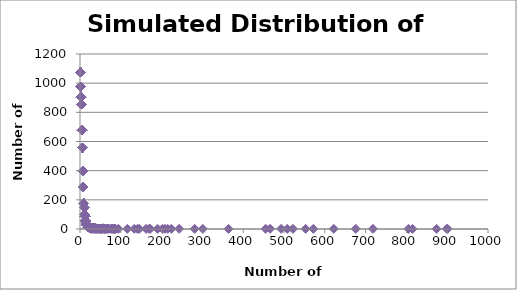
| Category | Simulated Number of Athletes |
|---|---|
| 901.0 | 1 |
| 899.0 | 1 |
| 874.0 | 1 |
| 815.0 | 1 |
| 805.0 | 1 |
| 718.0 | 1 |
| 676.0 | 1 |
| 622.0 | 1 |
| 572.0 | 1 |
| 553.0 | 1 |
| 522.0 | 1 |
| 508.0 | 1 |
| 493.0 | 1 |
| 466.0 | 1 |
| 455.0 | 1 |
| 364.0 | 1 |
| 301.0 | 1 |
| 281.0 | 1 |
| 243.0 | 1 |
| 224.0 | 1 |
| 215.0 | 1 |
| 208.0 | 1 |
| 202.0 | 1 |
| 190.0 | 1 |
| 172.0 | 1 |
| 169.0 | 1 |
| 162.0 | 1 |
| 145.0 | 1 |
| 141.0 | 1 |
| 133.0 | 1 |
| 116.0 | 1 |
| 94.0 | 1 |
| 87.0 | 1 |
| 86.0 | 1 |
| 85.0 | 1 |
| 84.0 | 1 |
| 82.0 | 1 |
| 80.0 | 1 |
| 78.0 | 2 |
| 78.0 | 2 |
| 74.0 | 1 |
| 69.0 | 3 |
| 69.0 | 3 |
| 69.0 | 3 |
| 68.0 | 1 |
| 64.0 | 1 |
| 63.0 | 1 |
| 61.0 | 1 |
| 60.0 | 1 |
| 58.0 | 3 |
| 58.0 | 3 |
| 58.0 | 3 |
| 57.0 | 4 |
| 57.0 | 4 |
| 57.0 | 4 |
| 57.0 | 4 |
| 56.0 | 2 |
| 56.0 | 2 |
| 54.0 | 2 |
| 54.0 | 2 |
| 52.0 | 2 |
| 52.0 | 2 |
| 51.0 | 1 |
| 50.0 | 2 |
| 50.0 | 2 |
| 49.0 | 1 |
| 48.0 | 3 |
| 48.0 | 3 |
| 48.0 | 3 |
| 47.0 | 1 |
| 44.0 | 3 |
| 44.0 | 3 |
| 44.0 | 3 |
| 42.0 | 2 |
| 42.0 | 2 |
| 41.0 | 3 |
| 41.0 | 3 |
| 41.0 | 3 |
| 40.0 | 3 |
| 40.0 | 3 |
| 40.0 | 3 |
| 39.0 | 3 |
| 39.0 | 3 |
| 39.0 | 3 |
| 38.0 | 5 |
| 38.0 | 5 |
| 38.0 | 5 |
| 38.0 | 5 |
| 38.0 | 5 |
| 37.0 | 2 |
| 37.0 | 2 |
| 36.0 | 5 |
| 36.0 | 5 |
| 36.0 | 5 |
| 36.0 | 5 |
| 36.0 | 5 |
| 35.0 | 1 |
| 34.0 | 6 |
| 34.0 | 6 |
| 34.0 | 6 |
| 34.0 | 6 |
| 34.0 | 6 |
| 34.0 | 6 |
| 33.0 | 3 |
| 33.0 | 3 |
| 33.0 | 3 |
| 32.0 | 4 |
| 32.0 | 4 |
| 32.0 | 4 |
| 32.0 | 4 |
| 31.0 | 6 |
| 31.0 | 6 |
| 31.0 | 6 |
| 31.0 | 6 |
| 31.0 | 6 |
| 31.0 | 6 |
| 30.0 | 2 |
| 30.0 | 2 |
| 29.0 | 4 |
| 29.0 | 4 |
| 29.0 | 4 |
| 29.0 | 4 |
| 28.0 | 7 |
| 28.0 | 7 |
| 28.0 | 7 |
| 28.0 | 7 |
| 28.0 | 7 |
| 28.0 | 7 |
| 28.0 | 7 |
| 27.0 | 2 |
| 27.0 | 2 |
| 26.0 | 9 |
| 26.0 | 9 |
| 26.0 | 9 |
| 26.0 | 9 |
| 26.0 | 9 |
| 26.0 | 9 |
| 26.0 | 9 |
| 26.0 | 9 |
| 26.0 | 9 |
| 25.0 | 7 |
| 25.0 | 7 |
| 25.0 | 7 |
| 25.0 | 7 |
| 25.0 | 7 |
| 25.0 | 7 |
| 25.0 | 7 |
| 24.0 | 5 |
| 24.0 | 5 |
| 24.0 | 5 |
| 24.0 | 5 |
| 24.0 | 5 |
| 23.0 | 13 |
| 23.0 | 13 |
| 23.0 | 13 |
| 23.0 | 13 |
| 23.0 | 13 |
| 23.0 | 13 |
| 23.0 | 13 |
| 23.0 | 13 |
| 23.0 | 13 |
| 23.0 | 13 |
| 23.0 | 13 |
| 23.0 | 13 |
| 23.0 | 13 |
| 22.0 | 10 |
| 22.0 | 10 |
| 22.0 | 10 |
| 22.0 | 10 |
| 22.0 | 10 |
| 22.0 | 10 |
| 22.0 | 10 |
| 22.0 | 10 |
| 22.0 | 10 |
| 22.0 | 10 |
| 21.0 | 11 |
| 21.0 | 11 |
| 21.0 | 11 |
| 21.0 | 11 |
| 21.0 | 11 |
| 21.0 | 11 |
| 21.0 | 11 |
| 21.0 | 11 |
| 21.0 | 11 |
| 21.0 | 11 |
| 21.0 | 11 |
| 20.0 | 13 |
| 20.0 | 13 |
| 20.0 | 13 |
| 20.0 | 13 |
| 20.0 | 13 |
| 20.0 | 13 |
| 20.0 | 13 |
| 20.0 | 13 |
| 20.0 | 13 |
| 20.0 | 13 |
| 20.0 | 13 |
| 20.0 | 13 |
| 20.0 | 13 |
| 19.0 | 12 |
| 19.0 | 12 |
| 19.0 | 12 |
| 19.0 | 12 |
| 19.0 | 12 |
| 19.0 | 12 |
| 19.0 | 12 |
| 19.0 | 12 |
| 19.0 | 12 |
| 19.0 | 12 |
| 19.0 | 12 |
| 19.0 | 12 |
| 18.0 | 23 |
| 18.0 | 23 |
| 18.0 | 23 |
| 18.0 | 23 |
| 18.0 | 23 |
| 18.0 | 23 |
| 18.0 | 23 |
| 18.0 | 23 |
| 18.0 | 23 |
| 18.0 | 23 |
| 18.0 | 23 |
| 18.0 | 23 |
| 18.0 | 23 |
| 18.0 | 23 |
| 18.0 | 23 |
| 18.0 | 23 |
| 18.0 | 23 |
| 18.0 | 23 |
| 18.0 | 23 |
| 18.0 | 23 |
| 18.0 | 23 |
| 18.0 | 23 |
| 18.0 | 23 |
| 17.0 | 25 |
| 17.0 | 25 |
| 17.0 | 25 |
| 17.0 | 25 |
| 17.0 | 25 |
| 17.0 | 25 |
| 17.0 | 25 |
| 17.0 | 25 |
| 17.0 | 25 |
| 17.0 | 25 |
| 17.0 | 25 |
| 17.0 | 25 |
| 17.0 | 25 |
| 17.0 | 25 |
| 17.0 | 25 |
| 17.0 | 25 |
| 17.0 | 25 |
| 17.0 | 25 |
| 17.0 | 25 |
| 17.0 | 25 |
| 17.0 | 25 |
| 17.0 | 25 |
| 17.0 | 25 |
| 17.0 | 25 |
| 17.0 | 25 |
| 16.0 | 30 |
| 16.0 | 30 |
| 16.0 | 30 |
| 16.0 | 30 |
| 16.0 | 30 |
| 16.0 | 30 |
| 16.0 | 30 |
| 16.0 | 30 |
| 16.0 | 30 |
| 16.0 | 30 |
| 16.0 | 30 |
| 16.0 | 30 |
| 16.0 | 30 |
| 16.0 | 30 |
| 16.0 | 30 |
| 16.0 | 30 |
| 16.0 | 30 |
| 16.0 | 30 |
| 16.0 | 30 |
| 16.0 | 30 |
| 16.0 | 30 |
| 16.0 | 30 |
| 16.0 | 30 |
| 16.0 | 30 |
| 16.0 | 30 |
| 16.0 | 30 |
| 16.0 | 30 |
| 16.0 | 30 |
| 16.0 | 30 |
| 16.0 | 30 |
| 15.0 | 37 |
| 15.0 | 37 |
| 15.0 | 37 |
| 15.0 | 37 |
| 15.0 | 37 |
| 15.0 | 37 |
| 15.0 | 37 |
| 15.0 | 37 |
| 15.0 | 37 |
| 15.0 | 37 |
| 15.0 | 37 |
| 15.0 | 37 |
| 15.0 | 37 |
| 15.0 | 37 |
| 15.0 | 37 |
| 15.0 | 37 |
| 15.0 | 37 |
| 15.0 | 37 |
| 15.0 | 37 |
| 15.0 | 37 |
| 15.0 | 37 |
| 15.0 | 37 |
| 15.0 | 37 |
| 15.0 | 37 |
| 15.0 | 37 |
| 15.0 | 37 |
| 15.0 | 37 |
| 15.0 | 37 |
| 15.0 | 37 |
| 15.0 | 37 |
| 15.0 | 37 |
| 15.0 | 37 |
| 15.0 | 37 |
| 15.0 | 37 |
| 15.0 | 37 |
| 15.0 | 37 |
| 15.0 | 37 |
| 14.0 | 53 |
| 14.0 | 53 |
| 14.0 | 53 |
| 14.0 | 53 |
| 14.0 | 53 |
| 14.0 | 53 |
| 14.0 | 53 |
| 14.0 | 53 |
| 14.0 | 53 |
| 14.0 | 53 |
| 14.0 | 53 |
| 14.0 | 53 |
| 14.0 | 53 |
| 14.0 | 53 |
| 14.0 | 53 |
| 14.0 | 53 |
| 14.0 | 53 |
| 14.0 | 53 |
| 14.0 | 53 |
| 14.0 | 53 |
| 14.0 | 53 |
| 14.0 | 53 |
| 14.0 | 53 |
| 14.0 | 53 |
| 14.0 | 53 |
| 14.0 | 53 |
| 14.0 | 53 |
| 14.0 | 53 |
| 14.0 | 53 |
| 14.0 | 53 |
| 14.0 | 53 |
| 14.0 | 53 |
| 14.0 | 53 |
| 14.0 | 53 |
| 14.0 | 53 |
| 14.0 | 53 |
| 14.0 | 53 |
| 14.0 | 53 |
| 14.0 | 53 |
| 14.0 | 53 |
| 14.0 | 53 |
| 14.0 | 53 |
| 14.0 | 53 |
| 14.0 | 53 |
| 14.0 | 53 |
| 14.0 | 53 |
| 14.0 | 53 |
| 14.0 | 53 |
| 14.0 | 53 |
| 14.0 | 53 |
| 14.0 | 53 |
| 14.0 | 53 |
| 14.0 | 53 |
| 13.0 | 58 |
| 13.0 | 58 |
| 13.0 | 58 |
| 13.0 | 58 |
| 13.0 | 58 |
| 13.0 | 58 |
| 13.0 | 58 |
| 13.0 | 58 |
| 13.0 | 58 |
| 13.0 | 58 |
| 13.0 | 58 |
| 13.0 | 58 |
| 13.0 | 58 |
| 13.0 | 58 |
| 13.0 | 58 |
| 13.0 | 58 |
| 13.0 | 58 |
| 13.0 | 58 |
| 13.0 | 58 |
| 13.0 | 58 |
| 13.0 | 58 |
| 13.0 | 58 |
| 13.0 | 58 |
| 13.0 | 58 |
| 13.0 | 58 |
| 13.0 | 58 |
| 13.0 | 58 |
| 13.0 | 58 |
| 13.0 | 58 |
| 13.0 | 58 |
| 13.0 | 58 |
| 13.0 | 58 |
| 13.0 | 58 |
| 13.0 | 58 |
| 13.0 | 58 |
| 13.0 | 58 |
| 13.0 | 58 |
| 13.0 | 58 |
| 13.0 | 58 |
| 13.0 | 58 |
| 13.0 | 58 |
| 13.0 | 58 |
| 13.0 | 58 |
| 13.0 | 58 |
| 13.0 | 58 |
| 13.0 | 58 |
| 13.0 | 58 |
| 13.0 | 58 |
| 13.0 | 58 |
| 13.0 | 58 |
| 13.0 | 58 |
| 13.0 | 58 |
| 13.0 | 58 |
| 13.0 | 58 |
| 13.0 | 58 |
| 13.0 | 58 |
| 13.0 | 58 |
| 13.0 | 58 |
| 12.0 | 88 |
| 12.0 | 88 |
| 12.0 | 88 |
| 12.0 | 88 |
| 12.0 | 88 |
| 12.0 | 88 |
| 12.0 | 88 |
| 12.0 | 88 |
| 12.0 | 88 |
| 12.0 | 88 |
| 12.0 | 88 |
| 12.0 | 88 |
| 12.0 | 88 |
| 12.0 | 88 |
| 12.0 | 88 |
| 12.0 | 88 |
| 12.0 | 88 |
| 12.0 | 88 |
| 12.0 | 88 |
| 12.0 | 88 |
| 12.0 | 88 |
| 12.0 | 88 |
| 12.0 | 88 |
| 12.0 | 88 |
| 12.0 | 88 |
| 12.0 | 88 |
| 12.0 | 88 |
| 12.0 | 88 |
| 12.0 | 88 |
| 12.0 | 88 |
| 12.0 | 88 |
| 12.0 | 88 |
| 12.0 | 88 |
| 12.0 | 88 |
| 12.0 | 88 |
| 12.0 | 88 |
| 12.0 | 88 |
| 12.0 | 88 |
| 12.0 | 88 |
| 12.0 | 88 |
| 12.0 | 88 |
| 12.0 | 88 |
| 12.0 | 88 |
| 12.0 | 88 |
| 12.0 | 88 |
| 12.0 | 88 |
| 12.0 | 88 |
| 12.0 | 88 |
| 12.0 | 88 |
| 12.0 | 88 |
| 12.0 | 88 |
| 12.0 | 88 |
| 12.0 | 88 |
| 12.0 | 88 |
| 12.0 | 88 |
| 12.0 | 88 |
| 12.0 | 88 |
| 12.0 | 88 |
| 12.0 | 88 |
| 12.0 | 88 |
| 12.0 | 88 |
| 12.0 | 88 |
| 12.0 | 88 |
| 12.0 | 88 |
| 12.0 | 88 |
| 12.0 | 88 |
| 12.0 | 88 |
| 12.0 | 88 |
| 12.0 | 88 |
| 12.0 | 88 |
| 12.0 | 88 |
| 12.0 | 88 |
| 12.0 | 88 |
| 12.0 | 88 |
| 12.0 | 88 |
| 12.0 | 88 |
| 12.0 | 88 |
| 12.0 | 88 |
| 12.0 | 88 |
| 12.0 | 88 |
| 12.0 | 88 |
| 12.0 | 88 |
| 12.0 | 88 |
| 12.0 | 88 |
| 12.0 | 88 |
| 12.0 | 88 |
| 12.0 | 88 |
| 12.0 | 88 |
| 11.0 | 101 |
| 11.0 | 101 |
| 11.0 | 101 |
| 11.0 | 101 |
| 11.0 | 101 |
| 11.0 | 101 |
| 11.0 | 101 |
| 11.0 | 101 |
| 11.0 | 101 |
| 11.0 | 101 |
| 11.0 | 101 |
| 11.0 | 101 |
| 11.0 | 101 |
| 11.0 | 101 |
| 11.0 | 101 |
| 11.0 | 101 |
| 11.0 | 101 |
| 11.0 | 101 |
| 11.0 | 101 |
| 11.0 | 101 |
| 11.0 | 101 |
| 11.0 | 101 |
| 11.0 | 101 |
| 11.0 | 101 |
| 11.0 | 101 |
| 11.0 | 101 |
| 11.0 | 101 |
| 11.0 | 101 |
| 11.0 | 101 |
| 11.0 | 101 |
| 11.0 | 101 |
| 11.0 | 101 |
| 11.0 | 101 |
| 11.0 | 101 |
| 11.0 | 101 |
| 11.0 | 101 |
| 11.0 | 101 |
| 11.0 | 101 |
| 11.0 | 101 |
| 11.0 | 101 |
| 11.0 | 101 |
| 11.0 | 101 |
| 11.0 | 101 |
| 11.0 | 101 |
| 11.0 | 101 |
| 11.0 | 101 |
| 11.0 | 101 |
| 11.0 | 101 |
| 11.0 | 101 |
| 11.0 | 101 |
| 11.0 | 101 |
| 11.0 | 101 |
| 11.0 | 101 |
| 11.0 | 101 |
| 11.0 | 101 |
| 11.0 | 101 |
| 11.0 | 101 |
| 11.0 | 101 |
| 11.0 | 101 |
| 11.0 | 101 |
| 11.0 | 101 |
| 11.0 | 101 |
| 11.0 | 101 |
| 11.0 | 101 |
| 11.0 | 101 |
| 11.0 | 101 |
| 11.0 | 101 |
| 11.0 | 101 |
| 11.0 | 101 |
| 11.0 | 101 |
| 11.0 | 101 |
| 11.0 | 101 |
| 11.0 | 101 |
| 11.0 | 101 |
| 11.0 | 101 |
| 11.0 | 101 |
| 11.0 | 101 |
| 11.0 | 101 |
| 11.0 | 101 |
| 11.0 | 101 |
| 11.0 | 101 |
| 11.0 | 101 |
| 11.0 | 101 |
| 11.0 | 101 |
| 11.0 | 101 |
| 11.0 | 101 |
| 11.0 | 101 |
| 11.0 | 101 |
| 11.0 | 101 |
| 11.0 | 101 |
| 11.0 | 101 |
| 11.0 | 101 |
| 11.0 | 101 |
| 11.0 | 101 |
| 11.0 | 101 |
| 11.0 | 101 |
| 11.0 | 101 |
| 11.0 | 101 |
| 11.0 | 101 |
| 11.0 | 101 |
| 11.0 | 101 |
| 10.0 | 147 |
| 10.0 | 147 |
| 10.0 | 147 |
| 10.0 | 147 |
| 10.0 | 147 |
| 10.0 | 147 |
| 10.0 | 147 |
| 10.0 | 147 |
| 10.0 | 147 |
| 10.0 | 147 |
| 10.0 | 147 |
| 10.0 | 147 |
| 10.0 | 147 |
| 10.0 | 147 |
| 10.0 | 147 |
| 10.0 | 147 |
| 10.0 | 147 |
| 10.0 | 147 |
| 10.0 | 147 |
| 10.0 | 147 |
| 10.0 | 147 |
| 10.0 | 147 |
| 10.0 | 147 |
| 10.0 | 147 |
| 10.0 | 147 |
| 10.0 | 147 |
| 10.0 | 147 |
| 10.0 | 147 |
| 10.0 | 147 |
| 10.0 | 147 |
| 10.0 | 147 |
| 10.0 | 147 |
| 10.0 | 147 |
| 10.0 | 147 |
| 10.0 | 147 |
| 10.0 | 147 |
| 10.0 | 147 |
| 10.0 | 147 |
| 10.0 | 147 |
| 10.0 | 147 |
| 10.0 | 147 |
| 10.0 | 147 |
| 10.0 | 147 |
| 10.0 | 147 |
| 10.0 | 147 |
| 10.0 | 147 |
| 10.0 | 147 |
| 10.0 | 147 |
| 10.0 | 147 |
| 10.0 | 147 |
| 10.0 | 147 |
| 10.0 | 147 |
| 10.0 | 147 |
| 10.0 | 147 |
| 10.0 | 147 |
| 10.0 | 147 |
| 10.0 | 147 |
| 10.0 | 147 |
| 10.0 | 147 |
| 10.0 | 147 |
| 10.0 | 147 |
| 10.0 | 147 |
| 10.0 | 147 |
| 10.0 | 147 |
| 10.0 | 147 |
| 10.0 | 147 |
| 10.0 | 147 |
| 10.0 | 147 |
| 10.0 | 147 |
| 10.0 | 147 |
| 10.0 | 147 |
| 10.0 | 147 |
| 10.0 | 147 |
| 10.0 | 147 |
| 10.0 | 147 |
| 10.0 | 147 |
| 10.0 | 147 |
| 10.0 | 147 |
| 10.0 | 147 |
| 10.0 | 147 |
| 10.0 | 147 |
| 10.0 | 147 |
| 10.0 | 147 |
| 10.0 | 147 |
| 10.0 | 147 |
| 10.0 | 147 |
| 10.0 | 147 |
| 10.0 | 147 |
| 10.0 | 147 |
| 10.0 | 147 |
| 10.0 | 147 |
| 10.0 | 147 |
| 10.0 | 147 |
| 10.0 | 147 |
| 10.0 | 147 |
| 10.0 | 147 |
| 10.0 | 147 |
| 10.0 | 147 |
| 10.0 | 147 |
| 10.0 | 147 |
| 10.0 | 147 |
| 10.0 | 147 |
| 10.0 | 147 |
| 10.0 | 147 |
| 10.0 | 147 |
| 10.0 | 147 |
| 10.0 | 147 |
| 10.0 | 147 |
| 10.0 | 147 |
| 10.0 | 147 |
| 10.0 | 147 |
| 10.0 | 147 |
| 10.0 | 147 |
| 10.0 | 147 |
| 10.0 | 147 |
| 10.0 | 147 |
| 10.0 | 147 |
| 10.0 | 147 |
| 10.0 | 147 |
| 10.0 | 147 |
| 10.0 | 147 |
| 10.0 | 147 |
| 10.0 | 147 |
| 10.0 | 147 |
| 10.0 | 147 |
| 10.0 | 147 |
| 10.0 | 147 |
| 10.0 | 147 |
| 10.0 | 147 |
| 10.0 | 147 |
| 10.0 | 147 |
| 10.0 | 147 |
| 10.0 | 147 |
| 10.0 | 147 |
| 10.0 | 147 |
| 10.0 | 147 |
| 10.0 | 147 |
| 10.0 | 147 |
| 10.0 | 147 |
| 10.0 | 147 |
| 10.0 | 147 |
| 10.0 | 147 |
| 10.0 | 147 |
| 10.0 | 147 |
| 10.0 | 147 |
| 10.0 | 147 |
| 10.0 | 147 |
| 9.0 | 177 |
| 9.0 | 177 |
| 9.0 | 177 |
| 9.0 | 177 |
| 9.0 | 177 |
| 9.0 | 177 |
| 9.0 | 177 |
| 9.0 | 177 |
| 9.0 | 177 |
| 9.0 | 177 |
| 9.0 | 177 |
| 9.0 | 177 |
| 9.0 | 177 |
| 9.0 | 177 |
| 9.0 | 177 |
| 9.0 | 177 |
| 9.0 | 177 |
| 9.0 | 177 |
| 9.0 | 177 |
| 9.0 | 177 |
| 9.0 | 177 |
| 9.0 | 177 |
| 9.0 | 177 |
| 9.0 | 177 |
| 9.0 | 177 |
| 9.0 | 177 |
| 9.0 | 177 |
| 9.0 | 177 |
| 9.0 | 177 |
| 9.0 | 177 |
| 9.0 | 177 |
| 9.0 | 177 |
| 9.0 | 177 |
| 9.0 | 177 |
| 9.0 | 177 |
| 9.0 | 177 |
| 9.0 | 177 |
| 9.0 | 177 |
| 9.0 | 177 |
| 9.0 | 177 |
| 9.0 | 177 |
| 9.0 | 177 |
| 9.0 | 177 |
| 9.0 | 177 |
| 9.0 | 177 |
| 9.0 | 177 |
| 9.0 | 177 |
| 9.0 | 177 |
| 9.0 | 177 |
| 9.0 | 177 |
| 9.0 | 177 |
| 9.0 | 177 |
| 9.0 | 177 |
| 9.0 | 177 |
| 9.0 | 177 |
| 9.0 | 177 |
| 9.0 | 177 |
| 9.0 | 177 |
| 9.0 | 177 |
| 9.0 | 177 |
| 9.0 | 177 |
| 9.0 | 177 |
| 9.0 | 177 |
| 9.0 | 177 |
| 9.0 | 177 |
| 9.0 | 177 |
| 9.0 | 177 |
| 9.0 | 177 |
| 9.0 | 177 |
| 9.0 | 177 |
| 9.0 | 177 |
| 9.0 | 177 |
| 9.0 | 177 |
| 9.0 | 177 |
| 9.0 | 177 |
| 9.0 | 177 |
| 9.0 | 177 |
| 9.0 | 177 |
| 9.0 | 177 |
| 9.0 | 177 |
| 9.0 | 177 |
| 9.0 | 177 |
| 9.0 | 177 |
| 9.0 | 177 |
| 9.0 | 177 |
| 9.0 | 177 |
| 9.0 | 177 |
| 9.0 | 177 |
| 9.0 | 177 |
| 9.0 | 177 |
| 9.0 | 177 |
| 9.0 | 177 |
| 9.0 | 177 |
| 9.0 | 177 |
| 9.0 | 177 |
| 9.0 | 177 |
| 9.0 | 177 |
| 9.0 | 177 |
| 9.0 | 177 |
| 9.0 | 177 |
| 9.0 | 177 |
| 9.0 | 177 |
| 9.0 | 177 |
| 9.0 | 177 |
| 9.0 | 177 |
| 9.0 | 177 |
| 9.0 | 177 |
| 9.0 | 177 |
| 9.0 | 177 |
| 9.0 | 177 |
| 9.0 | 177 |
| 9.0 | 177 |
| 9.0 | 177 |
| 9.0 | 177 |
| 9.0 | 177 |
| 9.0 | 177 |
| 9.0 | 177 |
| 9.0 | 177 |
| 9.0 | 177 |
| 9.0 | 177 |
| 9.0 | 177 |
| 9.0 | 177 |
| 9.0 | 177 |
| 9.0 | 177 |
| 9.0 | 177 |
| 9.0 | 177 |
| 9.0 | 177 |
| 9.0 | 177 |
| 9.0 | 177 |
| 9.0 | 177 |
| 9.0 | 177 |
| 9.0 | 177 |
| 9.0 | 177 |
| 9.0 | 177 |
| 9.0 | 177 |
| 9.0 | 177 |
| 9.0 | 177 |
| 9.0 | 177 |
| 9.0 | 177 |
| 9.0 | 177 |
| 9.0 | 177 |
| 9.0 | 177 |
| 9.0 | 177 |
| 9.0 | 177 |
| 9.0 | 177 |
| 9.0 | 177 |
| 9.0 | 177 |
| 9.0 | 177 |
| 9.0 | 177 |
| 9.0 | 177 |
| 9.0 | 177 |
| 9.0 | 177 |
| 9.0 | 177 |
| 9.0 | 177 |
| 9.0 | 177 |
| 9.0 | 177 |
| 9.0 | 177 |
| 9.0 | 177 |
| 9.0 | 177 |
| 9.0 | 177 |
| 9.0 | 177 |
| 9.0 | 177 |
| 9.0 | 177 |
| 9.0 | 177 |
| 9.0 | 177 |
| 9.0 | 177 |
| 9.0 | 177 |
| 9.0 | 177 |
| 9.0 | 177 |
| 9.0 | 177 |
| 9.0 | 177 |
| 9.0 | 177 |
| 9.0 | 177 |
| 9.0 | 177 |
| 9.0 | 177 |
| 9.0 | 177 |
| 9.0 | 177 |
| 8.0 | 288 |
| 8.0 | 288 |
| 8.0 | 288 |
| 8.0 | 288 |
| 8.0 | 288 |
| 8.0 | 288 |
| 8.0 | 288 |
| 8.0 | 288 |
| 8.0 | 288 |
| 8.0 | 288 |
| 8.0 | 288 |
| 8.0 | 288 |
| 8.0 | 288 |
| 8.0 | 288 |
| 8.0 | 288 |
| 8.0 | 288 |
| 8.0 | 288 |
| 8.0 | 288 |
| 8.0 | 288 |
| 8.0 | 288 |
| 8.0 | 288 |
| 8.0 | 288 |
| 8.0 | 288 |
| 8.0 | 288 |
| 8.0 | 288 |
| 8.0 | 288 |
| 8.0 | 288 |
| 8.0 | 288 |
| 8.0 | 288 |
| 8.0 | 288 |
| 8.0 | 288 |
| 8.0 | 288 |
| 8.0 | 288 |
| 8.0 | 288 |
| 8.0 | 288 |
| 8.0 | 288 |
| 8.0 | 288 |
| 8.0 | 288 |
| 8.0 | 288 |
| 8.0 | 288 |
| 8.0 | 288 |
| 8.0 | 288 |
| 8.0 | 288 |
| 8.0 | 288 |
| 8.0 | 288 |
| 8.0 | 288 |
| 8.0 | 288 |
| 8.0 | 288 |
| 8.0 | 288 |
| 8.0 | 288 |
| 8.0 | 288 |
| 8.0 | 288 |
| 8.0 | 288 |
| 8.0 | 288 |
| 8.0 | 288 |
| 8.0 | 288 |
| 8.0 | 288 |
| 8.0 | 288 |
| 8.0 | 288 |
| 8.0 | 288 |
| 8.0 | 288 |
| 8.0 | 288 |
| 8.0 | 288 |
| 8.0 | 288 |
| 8.0 | 288 |
| 8.0 | 288 |
| 8.0 | 288 |
| 8.0 | 288 |
| 8.0 | 288 |
| 8.0 | 288 |
| 8.0 | 288 |
| 8.0 | 288 |
| 8.0 | 288 |
| 8.0 | 288 |
| 8.0 | 288 |
| 8.0 | 288 |
| 8.0 | 288 |
| 8.0 | 288 |
| 8.0 | 288 |
| 8.0 | 288 |
| 8.0 | 288 |
| 8.0 | 288 |
| 8.0 | 288 |
| 8.0 | 288 |
| 8.0 | 288 |
| 8.0 | 288 |
| 8.0 | 288 |
| 8.0 | 288 |
| 8.0 | 288 |
| 8.0 | 288 |
| 8.0 | 288 |
| 8.0 | 288 |
| 8.0 | 288 |
| 8.0 | 288 |
| 8.0 | 288 |
| 8.0 | 288 |
| 8.0 | 288 |
| 8.0 | 288 |
| 8.0 | 288 |
| 8.0 | 288 |
| 8.0 | 288 |
| 8.0 | 288 |
| 8.0 | 288 |
| 8.0 | 288 |
| 8.0 | 288 |
| 8.0 | 288 |
| 8.0 | 288 |
| 8.0 | 288 |
| 8.0 | 288 |
| 8.0 | 288 |
| 8.0 | 288 |
| 8.0 | 288 |
| 8.0 | 288 |
| 8.0 | 288 |
| 8.0 | 288 |
| 8.0 | 288 |
| 8.0 | 288 |
| 8.0 | 288 |
| 8.0 | 288 |
| 8.0 | 288 |
| 8.0 | 288 |
| 8.0 | 288 |
| 8.0 | 288 |
| 8.0 | 288 |
| 8.0 | 288 |
| 8.0 | 288 |
| 8.0 | 288 |
| 8.0 | 288 |
| 8.0 | 288 |
| 8.0 | 288 |
| 8.0 | 288 |
| 8.0 | 288 |
| 8.0 | 288 |
| 8.0 | 288 |
| 8.0 | 288 |
| 8.0 | 288 |
| 8.0 | 288 |
| 8.0 | 288 |
| 8.0 | 288 |
| 8.0 | 288 |
| 8.0 | 288 |
| 8.0 | 288 |
| 8.0 | 288 |
| 8.0 | 288 |
| 8.0 | 288 |
| 8.0 | 288 |
| 8.0 | 288 |
| 8.0 | 288 |
| 8.0 | 288 |
| 8.0 | 288 |
| 8.0 | 288 |
| 8.0 | 288 |
| 8.0 | 288 |
| 8.0 | 288 |
| 8.0 | 288 |
| 8.0 | 288 |
| 8.0 | 288 |
| 8.0 | 288 |
| 8.0 | 288 |
| 8.0 | 288 |
| 8.0 | 288 |
| 8.0 | 288 |
| 8.0 | 288 |
| 8.0 | 288 |
| 8.0 | 288 |
| 8.0 | 288 |
| 8.0 | 288 |
| 8.0 | 288 |
| 8.0 | 288 |
| 8.0 | 288 |
| 8.0 | 288 |
| 8.0 | 288 |
| 8.0 | 288 |
| 8.0 | 288 |
| 8.0 | 288 |
| 8.0 | 288 |
| 8.0 | 288 |
| 8.0 | 288 |
| 8.0 | 288 |
| 8.0 | 288 |
| 8.0 | 288 |
| 8.0 | 288 |
| 8.0 | 288 |
| 8.0 | 288 |
| 8.0 | 288 |
| 8.0 | 288 |
| 8.0 | 288 |
| 8.0 | 288 |
| 8.0 | 288 |
| 8.0 | 288 |
| 8.0 | 288 |
| 8.0 | 288 |
| 8.0 | 288 |
| 8.0 | 288 |
| 8.0 | 288 |
| 8.0 | 288 |
| 8.0 | 288 |
| 8.0 | 288 |
| 8.0 | 288 |
| 8.0 | 288 |
| 8.0 | 288 |
| 8.0 | 288 |
| 8.0 | 288 |
| 8.0 | 288 |
| 8.0 | 288 |
| 8.0 | 288 |
| 8.0 | 288 |
| 8.0 | 288 |
| 8.0 | 288 |
| 8.0 | 288 |
| 8.0 | 288 |
| 8.0 | 288 |
| 8.0 | 288 |
| 8.0 | 288 |
| 8.0 | 288 |
| 8.0 | 288 |
| 8.0 | 288 |
| 8.0 | 288 |
| 8.0 | 288 |
| 8.0 | 288 |
| 8.0 | 288 |
| 8.0 | 288 |
| 8.0 | 288 |
| 8.0 | 288 |
| 8.0 | 288 |
| 8.0 | 288 |
| 8.0 | 288 |
| 8.0 | 288 |
| 8.0 | 288 |
| 8.0 | 288 |
| 8.0 | 288 |
| 8.0 | 288 |
| 8.0 | 288 |
| 8.0 | 288 |
| 8.0 | 288 |
| 8.0 | 288 |
| 8.0 | 288 |
| 8.0 | 288 |
| 8.0 | 288 |
| 8.0 | 288 |
| 8.0 | 288 |
| 8.0 | 288 |
| 8.0 | 288 |
| 8.0 | 288 |
| 8.0 | 288 |
| 8.0 | 288 |
| 8.0 | 288 |
| 8.0 | 288 |
| 8.0 | 288 |
| 8.0 | 288 |
| 8.0 | 288 |
| 8.0 | 288 |
| 8.0 | 288 |
| 8.0 | 288 |
| 8.0 | 288 |
| 8.0 | 288 |
| 8.0 | 288 |
| 8.0 | 288 |
| 8.0 | 288 |
| 8.0 | 288 |
| 8.0 | 288 |
| 8.0 | 288 |
| 8.0 | 288 |
| 8.0 | 288 |
| 8.0 | 288 |
| 8.0 | 288 |
| 8.0 | 288 |
| 8.0 | 288 |
| 8.0 | 288 |
| 8.0 | 288 |
| 8.0 | 288 |
| 8.0 | 288 |
| 8.0 | 288 |
| 8.0 | 288 |
| 8.0 | 288 |
| 8.0 | 288 |
| 8.0 | 288 |
| 8.0 | 288 |
| 8.0 | 288 |
| 8.0 | 288 |
| 8.0 | 288 |
| 8.0 | 288 |
| 8.0 | 288 |
| 8.0 | 288 |
| 8.0 | 288 |
| 8.0 | 288 |
| 8.0 | 288 |
| 8.0 | 288 |
| 7.0 | 398 |
| 7.0 | 398 |
| 7.0 | 398 |
| 7.0 | 398 |
| 7.0 | 398 |
| 7.0 | 398 |
| 7.0 | 398 |
| 7.0 | 398 |
| 7.0 | 398 |
| 7.0 | 398 |
| 7.0 | 398 |
| 7.0 | 398 |
| 7.0 | 398 |
| 7.0 | 398 |
| 7.0 | 398 |
| 7.0 | 398 |
| 7.0 | 398 |
| 7.0 | 398 |
| 7.0 | 398 |
| 7.0 | 398 |
| 7.0 | 398 |
| 7.0 | 398 |
| 7.0 | 398 |
| 7.0 | 398 |
| 7.0 | 398 |
| 7.0 | 398 |
| 7.0 | 398 |
| 7.0 | 398 |
| 7.0 | 398 |
| 7.0 | 398 |
| 7.0 | 398 |
| 7.0 | 398 |
| 7.0 | 398 |
| 7.0 | 398 |
| 7.0 | 398 |
| 7.0 | 398 |
| 7.0 | 398 |
| 7.0 | 398 |
| 7.0 | 398 |
| 7.0 | 398 |
| 7.0 | 398 |
| 7.0 | 398 |
| 7.0 | 398 |
| 7.0 | 398 |
| 7.0 | 398 |
| 7.0 | 398 |
| 7.0 | 398 |
| 7.0 | 398 |
| 7.0 | 398 |
| 7.0 | 398 |
| 7.0 | 398 |
| 7.0 | 398 |
| 7.0 | 398 |
| 7.0 | 398 |
| 7.0 | 398 |
| 7.0 | 398 |
| 7.0 | 398 |
| 7.0 | 398 |
| 7.0 | 398 |
| 7.0 | 398 |
| 7.0 | 398 |
| 7.0 | 398 |
| 7.0 | 398 |
| 7.0 | 398 |
| 7.0 | 398 |
| 7.0 | 398 |
| 7.0 | 398 |
| 7.0 | 398 |
| 7.0 | 398 |
| 7.0 | 398 |
| 7.0 | 398 |
| 7.0 | 398 |
| 7.0 | 398 |
| 7.0 | 398 |
| 7.0 | 398 |
| 7.0 | 398 |
| 7.0 | 398 |
| 7.0 | 398 |
| 7.0 | 398 |
| 7.0 | 398 |
| 7.0 | 398 |
| 7.0 | 398 |
| 7.0 | 398 |
| 7.0 | 398 |
| 7.0 | 398 |
| 7.0 | 398 |
| 7.0 | 398 |
| 7.0 | 398 |
| 7.0 | 398 |
| 7.0 | 398 |
| 7.0 | 398 |
| 7.0 | 398 |
| 7.0 | 398 |
| 7.0 | 398 |
| 7.0 | 398 |
| 7.0 | 398 |
| 7.0 | 398 |
| 7.0 | 398 |
| 7.0 | 398 |
| 7.0 | 398 |
| 7.0 | 398 |
| 7.0 | 398 |
| 7.0 | 398 |
| 7.0 | 398 |
| 7.0 | 398 |
| 7.0 | 398 |
| 7.0 | 398 |
| 7.0 | 398 |
| 7.0 | 398 |
| 7.0 | 398 |
| 7.0 | 398 |
| 7.0 | 398 |
| 7.0 | 398 |
| 7.0 | 398 |
| 7.0 | 398 |
| 7.0 | 398 |
| 7.0 | 398 |
| 7.0 | 398 |
| 7.0 | 398 |
| 7.0 | 398 |
| 7.0 | 398 |
| 7.0 | 398 |
| 7.0 | 398 |
| 7.0 | 398 |
| 7.0 | 398 |
| 7.0 | 398 |
| 7.0 | 398 |
| 7.0 | 398 |
| 7.0 | 398 |
| 7.0 | 398 |
| 7.0 | 398 |
| 7.0 | 398 |
| 7.0 | 398 |
| 7.0 | 398 |
| 7.0 | 398 |
| 7.0 | 398 |
| 7.0 | 398 |
| 7.0 | 398 |
| 7.0 | 398 |
| 7.0 | 398 |
| 7.0 | 398 |
| 7.0 | 398 |
| 7.0 | 398 |
| 7.0 | 398 |
| 7.0 | 398 |
| 7.0 | 398 |
| 7.0 | 398 |
| 7.0 | 398 |
| 7.0 | 398 |
| 7.0 | 398 |
| 7.0 | 398 |
| 7.0 | 398 |
| 7.0 | 398 |
| 7.0 | 398 |
| 7.0 | 398 |
| 7.0 | 398 |
| 7.0 | 398 |
| 7.0 | 398 |
| 7.0 | 398 |
| 7.0 | 398 |
| 7.0 | 398 |
| 7.0 | 398 |
| 7.0 | 398 |
| 7.0 | 398 |
| 7.0 | 398 |
| 7.0 | 398 |
| 7.0 | 398 |
| 7.0 | 398 |
| 7.0 | 398 |
| 7.0 | 398 |
| 7.0 | 398 |
| 7.0 | 398 |
| 7.0 | 398 |
| 7.0 | 398 |
| 7.0 | 398 |
| 7.0 | 398 |
| 7.0 | 398 |
| 7.0 | 398 |
| 7.0 | 398 |
| 7.0 | 398 |
| 7.0 | 398 |
| 7.0 | 398 |
| 7.0 | 398 |
| 7.0 | 398 |
| 7.0 | 398 |
| 7.0 | 398 |
| 7.0 | 398 |
| 7.0 | 398 |
| 7.0 | 398 |
| 7.0 | 398 |
| 7.0 | 398 |
| 7.0 | 398 |
| 7.0 | 398 |
| 7.0 | 398 |
| 7.0 | 398 |
| 7.0 | 398 |
| 7.0 | 398 |
| 7.0 | 398 |
| 7.0 | 398 |
| 7.0 | 398 |
| 7.0 | 398 |
| 7.0 | 398 |
| 7.0 | 398 |
| 7.0 | 398 |
| 7.0 | 398 |
| 7.0 | 398 |
| 7.0 | 398 |
| 7.0 | 398 |
| 7.0 | 398 |
| 7.0 | 398 |
| 7.0 | 398 |
| 7.0 | 398 |
| 7.0 | 398 |
| 7.0 | 398 |
| 7.0 | 398 |
| 7.0 | 398 |
| 7.0 | 398 |
| 7.0 | 398 |
| 7.0 | 398 |
| 7.0 | 398 |
| 7.0 | 398 |
| 7.0 | 398 |
| 7.0 | 398 |
| 7.0 | 398 |
| 7.0 | 398 |
| 7.0 | 398 |
| 7.0 | 398 |
| 7.0 | 398 |
| 7.0 | 398 |
| 7.0 | 398 |
| 7.0 | 398 |
| 7.0 | 398 |
| 7.0 | 398 |
| 7.0 | 398 |
| 7.0 | 398 |
| 7.0 | 398 |
| 7.0 | 398 |
| 7.0 | 398 |
| 7.0 | 398 |
| 7.0 | 398 |
| 7.0 | 398 |
| 7.0 | 398 |
| 7.0 | 398 |
| 7.0 | 398 |
| 7.0 | 398 |
| 7.0 | 398 |
| 7.0 | 398 |
| 7.0 | 398 |
| 7.0 | 398 |
| 7.0 | 398 |
| 7.0 | 398 |
| 7.0 | 398 |
| 7.0 | 398 |
| 7.0 | 398 |
| 7.0 | 398 |
| 7.0 | 398 |
| 7.0 | 398 |
| 7.0 | 398 |
| 7.0 | 398 |
| 7.0 | 398 |
| 7.0 | 398 |
| 7.0 | 398 |
| 7.0 | 398 |
| 7.0 | 398 |
| 7.0 | 398 |
| 7.0 | 398 |
| 7.0 | 398 |
| 7.0 | 398 |
| 7.0 | 398 |
| 7.0 | 398 |
| 7.0 | 398 |
| 7.0 | 398 |
| 7.0 | 398 |
| 7.0 | 398 |
| 7.0 | 398 |
| 7.0 | 398 |
| 7.0 | 398 |
| 7.0 | 398 |
| 7.0 | 398 |
| 7.0 | 398 |
| 7.0 | 398 |
| 7.0 | 398 |
| 7.0 | 398 |
| 7.0 | 398 |
| 7.0 | 398 |
| 7.0 | 398 |
| 7.0 | 398 |
| 7.0 | 398 |
| 7.0 | 398 |
| 7.0 | 398 |
| 7.0 | 398 |
| 7.0 | 398 |
| 7.0 | 398 |
| 7.0 | 398 |
| 7.0 | 398 |
| 7.0 | 398 |
| 7.0 | 398 |
| 7.0 | 398 |
| 7.0 | 398 |
| 7.0 | 398 |
| 7.0 | 398 |
| 7.0 | 398 |
| 7.0 | 398 |
| 7.0 | 398 |
| 7.0 | 398 |
| 7.0 | 398 |
| 7.0 | 398 |
| 7.0 | 398 |
| 7.0 | 398 |
| 7.0 | 398 |
| 7.0 | 398 |
| 7.0 | 398 |
| 7.0 | 398 |
| 7.0 | 398 |
| 7.0 | 398 |
| 7.0 | 398 |
| 7.0 | 398 |
| 7.0 | 398 |
| 7.0 | 398 |
| 7.0 | 398 |
| 7.0 | 398 |
| 7.0 | 398 |
| 7.0 | 398 |
| 7.0 | 398 |
| 7.0 | 398 |
| 7.0 | 398 |
| 7.0 | 398 |
| 7.0 | 398 |
| 7.0 | 398 |
| 7.0 | 398 |
| 7.0 | 398 |
| 7.0 | 398 |
| 7.0 | 398 |
| 7.0 | 398 |
| 7.0 | 398 |
| 7.0 | 398 |
| 7.0 | 398 |
| 7.0 | 398 |
| 7.0 | 398 |
| 7.0 | 398 |
| 7.0 | 398 |
| 7.0 | 398 |
| 7.0 | 398 |
| 7.0 | 398 |
| 7.0 | 398 |
| 7.0 | 398 |
| 7.0 | 398 |
| 7.0 | 398 |
| 7.0 | 398 |
| 7.0 | 398 |
| 7.0 | 398 |
| 7.0 | 398 |
| 7.0 | 398 |
| 7.0 | 398 |
| 7.0 | 398 |
| 7.0 | 398 |
| 7.0 | 398 |
| 7.0 | 398 |
| 7.0 | 398 |
| 7.0 | 398 |
| 7.0 | 398 |
| 7.0 | 398 |
| 7.0 | 398 |
| 7.0 | 398 |
| 7.0 | 398 |
| 7.0 | 398 |
| 7.0 | 398 |
| 7.0 | 398 |
| 7.0 | 398 |
| 7.0 | 398 |
| 7.0 | 398 |
| 7.0 | 398 |
| 7.0 | 398 |
| 7.0 | 398 |
| 7.0 | 398 |
| 7.0 | 398 |
| 7.0 | 398 |
| 7.0 | 398 |
| 7.0 | 398 |
| 7.0 | 398 |
| 7.0 | 398 |
| 7.0 | 398 |
| 7.0 | 398 |
| 7.0 | 398 |
| 7.0 | 398 |
| 7.0 | 398 |
| 7.0 | 398 |
| 7.0 | 398 |
| 7.0 | 398 |
| 7.0 | 398 |
| 7.0 | 398 |
| 7.0 | 398 |
| 7.0 | 398 |
| 7.0 | 398 |
| 7.0 | 398 |
| 7.0 | 398 |
| 7.0 | 398 |
| 7.0 | 398 |
| 6.0 | 556 |
| 6.0 | 556 |
| 6.0 | 556 |
| 6.0 | 556 |
| 6.0 | 556 |
| 6.0 | 556 |
| 6.0 | 556 |
| 6.0 | 556 |
| 6.0 | 556 |
| 6.0 | 556 |
| 6.0 | 556 |
| 6.0 | 556 |
| 6.0 | 556 |
| 6.0 | 556 |
| 6.0 | 556 |
| 6.0 | 556 |
| 6.0 | 556 |
| 6.0 | 556 |
| 6.0 | 556 |
| 6.0 | 556 |
| 6.0 | 556 |
| 6.0 | 556 |
| 6.0 | 556 |
| 6.0 | 556 |
| 6.0 | 556 |
| 6.0 | 556 |
| 6.0 | 556 |
| 6.0 | 556 |
| 6.0 | 556 |
| 6.0 | 556 |
| 6.0 | 556 |
| 6.0 | 556 |
| 6.0 | 556 |
| 6.0 | 556 |
| 6.0 | 556 |
| 6.0 | 556 |
| 6.0 | 556 |
| 6.0 | 556 |
| 6.0 | 556 |
| 6.0 | 556 |
| 6.0 | 556 |
| 6.0 | 556 |
| 6.0 | 556 |
| 6.0 | 556 |
| 6.0 | 556 |
| 6.0 | 556 |
| 6.0 | 556 |
| 6.0 | 556 |
| 6.0 | 556 |
| 6.0 | 556 |
| 6.0 | 556 |
| 6.0 | 556 |
| 6.0 | 556 |
| 6.0 | 556 |
| 6.0 | 556 |
| 6.0 | 556 |
| 6.0 | 556 |
| 6.0 | 556 |
| 6.0 | 556 |
| 6.0 | 556 |
| 6.0 | 556 |
| 6.0 | 556 |
| 6.0 | 556 |
| 6.0 | 556 |
| 6.0 | 556 |
| 6.0 | 556 |
| 6.0 | 556 |
| 6.0 | 556 |
| 6.0 | 556 |
| 6.0 | 556 |
| 6.0 | 556 |
| 6.0 | 556 |
| 6.0 | 556 |
| 6.0 | 556 |
| 6.0 | 556 |
| 6.0 | 556 |
| 6.0 | 556 |
| 6.0 | 556 |
| 6.0 | 556 |
| 6.0 | 556 |
| 6.0 | 556 |
| 6.0 | 556 |
| 6.0 | 556 |
| 6.0 | 556 |
| 6.0 | 556 |
| 6.0 | 556 |
| 6.0 | 556 |
| 6.0 | 556 |
| 6.0 | 556 |
| 6.0 | 556 |
| 6.0 | 556 |
| 6.0 | 556 |
| 6.0 | 556 |
| 6.0 | 556 |
| 6.0 | 556 |
| 6.0 | 556 |
| 6.0 | 556 |
| 6.0 | 556 |
| 6.0 | 556 |
| 6.0 | 556 |
| 6.0 | 556 |
| 6.0 | 556 |
| 6.0 | 556 |
| 6.0 | 556 |
| 6.0 | 556 |
| 6.0 | 556 |
| 6.0 | 556 |
| 6.0 | 556 |
| 6.0 | 556 |
| 6.0 | 556 |
| 6.0 | 556 |
| 6.0 | 556 |
| 6.0 | 556 |
| 6.0 | 556 |
| 6.0 | 556 |
| 6.0 | 556 |
| 6.0 | 556 |
| 6.0 | 556 |
| 6.0 | 556 |
| 6.0 | 556 |
| 6.0 | 556 |
| 6.0 | 556 |
| 6.0 | 556 |
| 6.0 | 556 |
| 6.0 | 556 |
| 6.0 | 556 |
| 6.0 | 556 |
| 6.0 | 556 |
| 6.0 | 556 |
| 6.0 | 556 |
| 6.0 | 556 |
| 6.0 | 556 |
| 6.0 | 556 |
| 6.0 | 556 |
| 6.0 | 556 |
| 6.0 | 556 |
| 6.0 | 556 |
| 6.0 | 556 |
| 6.0 | 556 |
| 6.0 | 556 |
| 6.0 | 556 |
| 6.0 | 556 |
| 6.0 | 556 |
| 6.0 | 556 |
| 6.0 | 556 |
| 6.0 | 556 |
| 6.0 | 556 |
| 6.0 | 556 |
| 6.0 | 556 |
| 6.0 | 556 |
| 6.0 | 556 |
| 6.0 | 556 |
| 6.0 | 556 |
| 6.0 | 556 |
| 6.0 | 556 |
| 6.0 | 556 |
| 6.0 | 556 |
| 6.0 | 556 |
| 6.0 | 556 |
| 6.0 | 556 |
| 6.0 | 556 |
| 6.0 | 556 |
| 6.0 | 556 |
| 6.0 | 556 |
| 6.0 | 556 |
| 6.0 | 556 |
| 6.0 | 556 |
| 6.0 | 556 |
| 6.0 | 556 |
| 6.0 | 556 |
| 6.0 | 556 |
| 6.0 | 556 |
| 6.0 | 556 |
| 6.0 | 556 |
| 6.0 | 556 |
| 6.0 | 556 |
| 6.0 | 556 |
| 6.0 | 556 |
| 6.0 | 556 |
| 6.0 | 556 |
| 6.0 | 556 |
| 6.0 | 556 |
| 6.0 | 556 |
| 6.0 | 556 |
| 6.0 | 556 |
| 6.0 | 556 |
| 6.0 | 556 |
| 6.0 | 556 |
| 6.0 | 556 |
| 6.0 | 556 |
| 6.0 | 556 |
| 6.0 | 556 |
| 6.0 | 556 |
| 6.0 | 556 |
| 6.0 | 556 |
| 6.0 | 556 |
| 6.0 | 556 |
| 6.0 | 556 |
| 6.0 | 556 |
| 6.0 | 556 |
| 6.0 | 556 |
| 6.0 | 556 |
| 6.0 | 556 |
| 6.0 | 556 |
| 6.0 | 556 |
| 6.0 | 556 |
| 6.0 | 556 |
| 6.0 | 556 |
| 6.0 | 556 |
| 6.0 | 556 |
| 6.0 | 556 |
| 6.0 | 556 |
| 6.0 | 556 |
| 6.0 | 556 |
| 6.0 | 556 |
| 6.0 | 556 |
| 6.0 | 556 |
| 6.0 | 556 |
| 6.0 | 556 |
| 6.0 | 556 |
| 6.0 | 556 |
| 6.0 | 556 |
| 6.0 | 556 |
| 6.0 | 556 |
| 6.0 | 556 |
| 6.0 | 556 |
| 6.0 | 556 |
| 6.0 | 556 |
| 6.0 | 556 |
| 6.0 | 556 |
| 6.0 | 556 |
| 6.0 | 556 |
| 6.0 | 556 |
| 6.0 | 556 |
| 6.0 | 556 |
| 6.0 | 556 |
| 6.0 | 556 |
| 6.0 | 556 |
| 6.0 | 556 |
| 6.0 | 556 |
| 6.0 | 556 |
| 6.0 | 556 |
| 6.0 | 556 |
| 6.0 | 556 |
| 6.0 | 556 |
| 6.0 | 556 |
| 6.0 | 556 |
| 6.0 | 556 |
| 6.0 | 556 |
| 6.0 | 556 |
| 6.0 | 556 |
| 6.0 | 556 |
| 6.0 | 556 |
| 6.0 | 556 |
| 6.0 | 556 |
| 6.0 | 556 |
| 6.0 | 556 |
| 6.0 | 556 |
| 6.0 | 556 |
| 6.0 | 556 |
| 6.0 | 556 |
| 6.0 | 556 |
| 6.0 | 556 |
| 6.0 | 556 |
| 6.0 | 556 |
| 6.0 | 556 |
| 6.0 | 556 |
| 6.0 | 556 |
| 6.0 | 556 |
| 6.0 | 556 |
| 6.0 | 556 |
| 6.0 | 556 |
| 6.0 | 556 |
| 6.0 | 556 |
| 6.0 | 556 |
| 6.0 | 556 |
| 6.0 | 556 |
| 6.0 | 556 |
| 6.0 | 556 |
| 6.0 | 556 |
| 6.0 | 556 |
| 6.0 | 556 |
| 6.0 | 556 |
| 6.0 | 556 |
| 6.0 | 556 |
| 6.0 | 556 |
| 6.0 | 556 |
| 6.0 | 556 |
| 6.0 | 556 |
| 6.0 | 556 |
| 6.0 | 556 |
| 6.0 | 556 |
| 6.0 | 556 |
| 6.0 | 556 |
| 6.0 | 556 |
| 6.0 | 556 |
| 6.0 | 556 |
| 6.0 | 556 |
| 6.0 | 556 |
| 6.0 | 556 |
| 6.0 | 556 |
| 6.0 | 556 |
| 6.0 | 556 |
| 6.0 | 556 |
| 6.0 | 556 |
| 6.0 | 556 |
| 6.0 | 556 |
| 6.0 | 556 |
| 6.0 | 556 |
| 6.0 | 556 |
| 6.0 | 556 |
| 6.0 | 556 |
| 6.0 | 556 |
| 6.0 | 556 |
| 6.0 | 556 |
| 6.0 | 556 |
| 6.0 | 556 |
| 6.0 | 556 |
| 6.0 | 556 |
| 6.0 | 556 |
| 6.0 | 556 |
| 6.0 | 556 |
| 6.0 | 556 |
| 6.0 | 556 |
| 6.0 | 556 |
| 6.0 | 556 |
| 6.0 | 556 |
| 6.0 | 556 |
| 6.0 | 556 |
| 6.0 | 556 |
| 6.0 | 556 |
| 6.0 | 556 |
| 6.0 | 556 |
| 6.0 | 556 |
| 6.0 | 556 |
| 6.0 | 556 |
| 6.0 | 556 |
| 6.0 | 556 |
| 6.0 | 556 |
| 6.0 | 556 |
| 6.0 | 556 |
| 6.0 | 556 |
| 6.0 | 556 |
| 6.0 | 556 |
| 6.0 | 556 |
| 6.0 | 556 |
| 6.0 | 556 |
| 6.0 | 556 |
| 6.0 | 556 |
| 6.0 | 556 |
| 6.0 | 556 |
| 6.0 | 556 |
| 6.0 | 556 |
| 6.0 | 556 |
| 6.0 | 556 |
| 6.0 | 556 |
| 6.0 | 556 |
| 6.0 | 556 |
| 6.0 | 556 |
| 6.0 | 556 |
| 6.0 | 556 |
| 6.0 | 556 |
| 6.0 | 556 |
| 6.0 | 556 |
| 6.0 | 556 |
| 6.0 | 556 |
| 6.0 | 556 |
| 6.0 | 556 |
| 6.0 | 556 |
| 6.0 | 556 |
| 6.0 | 556 |
| 6.0 | 556 |
| 6.0 | 556 |
| 6.0 | 556 |
| 6.0 | 556 |
| 6.0 | 556 |
| 6.0 | 556 |
| 6.0 | 556 |
| 6.0 | 556 |
| 6.0 | 556 |
| 6.0 | 556 |
| 6.0 | 556 |
| 6.0 | 556 |
| 6.0 | 556 |
| 6.0 | 556 |
| 6.0 | 556 |
| 6.0 | 556 |
| 6.0 | 556 |
| 6.0 | 556 |
| 6.0 | 556 |
| 6.0 | 556 |
| 6.0 | 556 |
| 6.0 | 556 |
| 6.0 | 556 |
| 6.0 | 556 |
| 6.0 | 556 |
| 6.0 | 556 |
| 6.0 | 556 |
| 6.0 | 556 |
| 6.0 | 556 |
| 6.0 | 556 |
| 6.0 | 556 |
| 6.0 | 556 |
| 6.0 | 556 |
| 6.0 | 556 |
| 6.0 | 556 |
| 6.0 | 556 |
| 6.0 | 556 |
| 6.0 | 556 |
| 6.0 | 556 |
| 6.0 | 556 |
| 6.0 | 556 |
| 6.0 | 556 |
| 6.0 | 556 |
| 6.0 | 556 |
| 6.0 | 556 |
| 6.0 | 556 |
| 6.0 | 556 |
| 6.0 | 556 |
| 6.0 | 556 |
| 6.0 | 556 |
| 6.0 | 556 |
| 6.0 | 556 |
| 6.0 | 556 |
| 6.0 | 556 |
| 6.0 | 556 |
| 6.0 | 556 |
| 6.0 | 556 |
| 6.0 | 556 |
| 6.0 | 556 |
| 6.0 | 556 |
| 6.0 | 556 |
| 6.0 | 556 |
| 6.0 | 556 |
| 6.0 | 556 |
| 6.0 | 556 |
| 6.0 | 556 |
| 6.0 | 556 |
| 6.0 | 556 |
| 6.0 | 556 |
| 6.0 | 556 |
| 6.0 | 556 |
| 6.0 | 556 |
| 6.0 | 556 |
| 6.0 | 556 |
| 6.0 | 556 |
| 6.0 | 556 |
| 6.0 | 556 |
| 6.0 | 556 |
| 6.0 | 556 |
| 6.0 | 556 |
| 6.0 | 556 |
| 6.0 | 556 |
| 6.0 | 556 |
| 6.0 | 556 |
| 6.0 | 556 |
| 6.0 | 556 |
| 6.0 | 556 |
| 6.0 | 556 |
| 6.0 | 556 |
| 6.0 | 556 |
| 6.0 | 556 |
| 6.0 | 556 |
| 6.0 | 556 |
| 6.0 | 556 |
| 6.0 | 556 |
| 6.0 | 556 |
| 6.0 | 556 |
| 6.0 | 556 |
| 6.0 | 556 |
| 6.0 | 556 |
| 6.0 | 556 |
| 6.0 | 556 |
| 6.0 | 556 |
| 6.0 | 556 |
| 6.0 | 556 |
| 6.0 | 556 |
| 6.0 | 556 |
| 6.0 | 556 |
| 6.0 | 556 |
| 6.0 | 556 |
| 6.0 | 556 |
| 6.0 | 556 |
| 6.0 | 556 |
| 6.0 | 556 |
| 6.0 | 556 |
| 6.0 | 556 |
| 6.0 | 556 |
| 6.0 | 556 |
| 6.0 | 556 |
| 6.0 | 556 |
| 6.0 | 556 |
| 6.0 | 556 |
| 6.0 | 556 |
| 6.0 | 556 |
| 6.0 | 556 |
| 6.0 | 556 |
| 6.0 | 556 |
| 6.0 | 556 |
| 6.0 | 556 |
| 6.0 | 556 |
| 6.0 | 556 |
| 6.0 | 556 |
| 6.0 | 556 |
| 6.0 | 556 |
| 6.0 | 556 |
| 6.0 | 556 |
| 6.0 | 556 |
| 6.0 | 556 |
| 6.0 | 556 |
| 6.0 | 556 |
| 6.0 | 556 |
| 6.0 | 556 |
| 6.0 | 556 |
| 6.0 | 556 |
| 6.0 | 556 |
| 6.0 | 556 |
| 6.0 | 556 |
| 6.0 | 556 |
| 6.0 | 556 |
| 6.0 | 556 |
| 6.0 | 556 |
| 6.0 | 556 |
| 6.0 | 556 |
| 6.0 | 556 |
| 6.0 | 556 |
| 6.0 | 556 |
| 6.0 | 556 |
| 6.0 | 556 |
| 6.0 | 556 |
| 6.0 | 556 |
| 6.0 | 556 |
| 6.0 | 556 |
| 6.0 | 556 |
| 6.0 | 556 |
| 6.0 | 556 |
| 6.0 | 556 |
| 6.0 | 556 |
| 6.0 | 556 |
| 6.0 | 556 |
| 6.0 | 556 |
| 6.0 | 556 |
| 6.0 | 556 |
| 6.0 | 556 |
| 6.0 | 556 |
| 6.0 | 556 |
| 6.0 | 556 |
| 6.0 | 556 |
| 6.0 | 556 |
| 6.0 | 556 |
| 6.0 | 556 |
| 6.0 | 556 |
| 6.0 | 556 |
| 6.0 | 556 |
| 6.0 | 556 |
| 6.0 | 556 |
| 5.0 | 676 |
| 5.0 | 676 |
| 5.0 | 676 |
| 5.0 | 676 |
| 5.0 | 676 |
| 5.0 | 676 |
| 5.0 | 676 |
| 5.0 | 676 |
| 5.0 | 676 |
| 5.0 | 676 |
| 5.0 | 676 |
| 5.0 | 676 |
| 5.0 | 676 |
| 5.0 | 676 |
| 5.0 | 676 |
| 5.0 | 676 |
| 5.0 | 676 |
| 5.0 | 676 |
| 5.0 | 676 |
| 5.0 | 676 |
| 5.0 | 676 |
| 5.0 | 676 |
| 5.0 | 676 |
| 5.0 | 676 |
| 5.0 | 676 |
| 5.0 | 676 |
| 5.0 | 676 |
| 5.0 | 676 |
| 5.0 | 676 |
| 5.0 | 676 |
| 5.0 | 676 |
| 5.0 | 676 |
| 5.0 | 676 |
| 5.0 | 676 |
| 5.0 | 676 |
| 5.0 | 676 |
| 5.0 | 676 |
| 5.0 | 676 |
| 5.0 | 676 |
| 5.0 | 676 |
| 5.0 | 676 |
| 5.0 | 676 |
| 5.0 | 676 |
| 5.0 | 676 |
| 5.0 | 676 |
| 5.0 | 676 |
| 5.0 | 676 |
| 5.0 | 676 |
| 5.0 | 676 |
| 5.0 | 676 |
| 5.0 | 676 |
| 5.0 | 676 |
| 5.0 | 676 |
| 5.0 | 676 |
| 5.0 | 676 |
| 5.0 | 676 |
| 5.0 | 676 |
| 5.0 | 676 |
| 5.0 | 676 |
| 5.0 | 676 |
| 5.0 | 676 |
| 5.0 | 676 |
| 5.0 | 676 |
| 5.0 | 676 |
| 5.0 | 676 |
| 5.0 | 676 |
| 5.0 | 676 |
| 5.0 | 676 |
| 5.0 | 676 |
| 5.0 | 676 |
| 5.0 | 676 |
| 5.0 | 676 |
| 5.0 | 676 |
| 5.0 | 676 |
| 5.0 | 676 |
| 5.0 | 676 |
| 5.0 | 676 |
| 5.0 | 676 |
| 5.0 | 676 |
| 5.0 | 676 |
| 5.0 | 676 |
| 5.0 | 676 |
| 5.0 | 676 |
| 5.0 | 676 |
| 5.0 | 676 |
| 5.0 | 676 |
| 5.0 | 676 |
| 5.0 | 676 |
| 5.0 | 676 |
| 5.0 | 676 |
| 5.0 | 676 |
| 5.0 | 676 |
| 5.0 | 676 |
| 5.0 | 676 |
| 5.0 | 676 |
| 5.0 | 676 |
| 5.0 | 676 |
| 5.0 | 676 |
| 5.0 | 676 |
| 5.0 | 676 |
| 5.0 | 676 |
| 5.0 | 676 |
| 5.0 | 676 |
| 5.0 | 676 |
| 5.0 | 676 |
| 5.0 | 676 |
| 5.0 | 676 |
| 5.0 | 676 |
| 5.0 | 676 |
| 5.0 | 676 |
| 5.0 | 676 |
| 5.0 | 676 |
| 5.0 | 676 |
| 5.0 | 676 |
| 5.0 | 676 |
| 5.0 | 676 |
| 5.0 | 676 |
| 5.0 | 676 |
| 5.0 | 676 |
| 5.0 | 676 |
| 5.0 | 676 |
| 5.0 | 676 |
| 5.0 | 676 |
| 5.0 | 676 |
| 5.0 | 676 |
| 5.0 | 676 |
| 5.0 | 676 |
| 5.0 | 676 |
| 5.0 | 676 |
| 5.0 | 676 |
| 5.0 | 676 |
| 5.0 | 676 |
| 5.0 | 676 |
| 5.0 | 676 |
| 5.0 | 676 |
| 5.0 | 676 |
| 5.0 | 676 |
| 5.0 | 676 |
| 5.0 | 676 |
| 5.0 | 676 |
| 5.0 | 676 |
| 5.0 | 676 |
| 5.0 | 676 |
| 5.0 | 676 |
| 5.0 | 676 |
| 5.0 | 676 |
| 5.0 | 676 |
| 5.0 | 676 |
| 5.0 | 676 |
| 5.0 | 676 |
| 5.0 | 676 |
| 5.0 | 676 |
| 5.0 | 676 |
| 5.0 | 676 |
| 5.0 | 676 |
| 5.0 | 676 |
| 5.0 | 676 |
| 5.0 | 676 |
| 5.0 | 676 |
| 5.0 | 676 |
| 5.0 | 676 |
| 5.0 | 676 |
| 5.0 | 676 |
| 5.0 | 676 |
| 5.0 | 676 |
| 5.0 | 676 |
| 5.0 | 676 |
| 5.0 | 676 |
| 5.0 | 676 |
| 5.0 | 676 |
| 5.0 | 676 |
| 5.0 | 676 |
| 5.0 | 676 |
| 5.0 | 676 |
| 5.0 | 676 |
| 5.0 | 676 |
| 5.0 | 676 |
| 5.0 | 676 |
| 5.0 | 676 |
| 5.0 | 676 |
| 5.0 | 676 |
| 5.0 | 676 |
| 5.0 | 676 |
| 5.0 | 676 |
| 5.0 | 676 |
| 5.0 | 676 |
| 5.0 | 676 |
| 5.0 | 676 |
| 5.0 | 676 |
| 5.0 | 676 |
| 5.0 | 676 |
| 5.0 | 676 |
| 5.0 | 676 |
| 5.0 | 676 |
| 5.0 | 676 |
| 5.0 | 676 |
| 5.0 | 676 |
| 5.0 | 676 |
| 5.0 | 676 |
| 5.0 | 676 |
| 5.0 | 676 |
| 5.0 | 676 |
| 5.0 | 676 |
| 5.0 | 676 |
| 5.0 | 676 |
| 5.0 | 676 |
| 5.0 | 676 |
| 5.0 | 676 |
| 5.0 | 676 |
| 5.0 | 676 |
| 5.0 | 676 |
| 5.0 | 676 |
| 5.0 | 676 |
| 5.0 | 676 |
| 5.0 | 676 |
| 5.0 | 676 |
| 5.0 | 676 |
| 5.0 | 676 |
| 5.0 | 676 |
| 5.0 | 676 |
| 5.0 | 676 |
| 5.0 | 676 |
| 5.0 | 676 |
| 5.0 | 676 |
| 5.0 | 676 |
| 5.0 | 676 |
| 5.0 | 676 |
| 5.0 | 676 |
| 5.0 | 676 |
| 5.0 | 676 |
| 5.0 | 676 |
| 5.0 | 676 |
| 5.0 | 676 |
| 5.0 | 676 |
| 5.0 | 676 |
| 5.0 | 676 |
| 5.0 | 676 |
| 5.0 | 676 |
| 5.0 | 676 |
| 5.0 | 676 |
| 5.0 | 676 |
| 5.0 | 676 |
| 5.0 | 676 |
| 5.0 | 676 |
| 5.0 | 676 |
| 5.0 | 676 |
| 5.0 | 676 |
| 5.0 | 676 |
| 5.0 | 676 |
| 5.0 | 676 |
| 5.0 | 676 |
| 5.0 | 676 |
| 5.0 | 676 |
| 5.0 | 676 |
| 5.0 | 676 |
| 5.0 | 676 |
| 5.0 | 676 |
| 5.0 | 676 |
| 5.0 | 676 |
| 5.0 | 676 |
| 5.0 | 676 |
| 5.0 | 676 |
| 5.0 | 676 |
| 5.0 | 676 |
| 5.0 | 676 |
| 5.0 | 676 |
| 5.0 | 676 |
| 5.0 | 676 |
| 5.0 | 676 |
| 5.0 | 676 |
| 5.0 | 676 |
| 5.0 | 676 |
| 5.0 | 676 |
| 5.0 | 676 |
| 5.0 | 676 |
| 5.0 | 676 |
| 5.0 | 676 |
| 5.0 | 676 |
| 5.0 | 676 |
| 5.0 | 676 |
| 5.0 | 676 |
| 5.0 | 676 |
| 5.0 | 676 |
| 5.0 | 676 |
| 5.0 | 676 |
| 5.0 | 676 |
| 5.0 | 676 |
| 5.0 | 676 |
| 5.0 | 676 |
| 5.0 | 676 |
| 5.0 | 676 |
| 5.0 | 676 |
| 5.0 | 676 |
| 5.0 | 676 |
| 5.0 | 676 |
| 5.0 | 676 |
| 5.0 | 676 |
| 5.0 | 676 |
| 5.0 | 676 |
| 5.0 | 676 |
| 5.0 | 676 |
| 5.0 | 676 |
| 5.0 | 676 |
| 5.0 | 676 |
| 5.0 | 676 |
| 5.0 | 676 |
| 5.0 | 676 |
| 5.0 | 676 |
| 5.0 | 676 |
| 5.0 | 676 |
| 5.0 | 676 |
| 5.0 | 676 |
| 5.0 | 676 |
| 5.0 | 676 |
| 5.0 | 676 |
| 5.0 | 676 |
| 5.0 | 676 |
| 5.0 | 676 |
| 5.0 | 676 |
| 5.0 | 676 |
| 5.0 | 676 |
| 5.0 | 676 |
| 5.0 | 676 |
| 5.0 | 676 |
| 5.0 | 676 |
| 5.0 | 676 |
| 5.0 | 676 |
| 5.0 | 676 |
| 5.0 | 676 |
| 5.0 | 676 |
| 5.0 | 676 |
| 5.0 | 676 |
| 5.0 | 676 |
| 5.0 | 676 |
| 5.0 | 676 |
| 5.0 | 676 |
| 5.0 | 676 |
| 5.0 | 676 |
| 5.0 | 676 |
| 5.0 | 676 |
| 5.0 | 676 |
| 5.0 | 676 |
| 5.0 | 676 |
| 5.0 | 676 |
| 5.0 | 676 |
| 5.0 | 676 |
| 5.0 | 676 |
| 5.0 | 676 |
| 5.0 | 676 |
| 5.0 | 676 |
| 5.0 | 676 |
| 5.0 | 676 |
| 5.0 | 676 |
| 5.0 | 676 |
| 5.0 | 676 |
| 5.0 | 676 |
| 5.0 | 676 |
| 5.0 | 676 |
| 5.0 | 676 |
| 5.0 | 676 |
| 5.0 | 676 |
| 5.0 | 676 |
| 5.0 | 676 |
| 5.0 | 676 |
| 5.0 | 676 |
| 5.0 | 676 |
| 5.0 | 676 |
| 5.0 | 676 |
| 5.0 | 676 |
| 5.0 | 676 |
| 5.0 | 676 |
| 5.0 | 676 |
| 5.0 | 676 |
| 5.0 | 676 |
| 5.0 | 676 |
| 5.0 | 676 |
| 5.0 | 676 |
| 5.0 | 676 |
| 5.0 | 676 |
| 5.0 | 676 |
| 5.0 | 676 |
| 5.0 | 676 |
| 5.0 | 676 |
| 5.0 | 676 |
| 5.0 | 676 |
| 5.0 | 676 |
| 5.0 | 676 |
| 5.0 | 676 |
| 5.0 | 676 |
| 5.0 | 676 |
| 5.0 | 676 |
| 5.0 | 676 |
| 5.0 | 676 |
| 5.0 | 676 |
| 5.0 | 676 |
| 5.0 | 676 |
| 5.0 | 676 |
| 5.0 | 676 |
| 5.0 | 676 |
| 5.0 | 676 |
| 5.0 | 676 |
| 5.0 | 676 |
| 5.0 | 676 |
| 5.0 | 676 |
| 5.0 | 676 |
| 5.0 | 676 |
| 5.0 | 676 |
| 5.0 | 676 |
| 5.0 | 676 |
| 5.0 | 676 |
| 5.0 | 676 |
| 5.0 | 676 |
| 5.0 | 676 |
| 5.0 | 676 |
| 5.0 | 676 |
| 5.0 | 676 |
| 5.0 | 676 |
| 5.0 | 676 |
| 5.0 | 676 |
| 5.0 | 676 |
| 5.0 | 676 |
| 5.0 | 676 |
| 5.0 | 676 |
| 5.0 | 676 |
| 5.0 | 676 |
| 5.0 | 676 |
| 5.0 | 676 |
| 5.0 | 676 |
| 5.0 | 676 |
| 5.0 | 676 |
| 5.0 | 676 |
| 5.0 | 676 |
| 5.0 | 676 |
| 5.0 | 676 |
| 5.0 | 676 |
| 5.0 | 676 |
| 5.0 | 676 |
| 5.0 | 676 |
| 5.0 | 676 |
| 5.0 | 676 |
| 5.0 | 676 |
| 5.0 | 676 |
| 5.0 | 676 |
| 5.0 | 676 |
| 5.0 | 676 |
| 5.0 | 676 |
| 5.0 | 676 |
| 5.0 | 676 |
| 5.0 | 676 |
| 5.0 | 676 |
| 5.0 | 676 |
| 5.0 | 676 |
| 5.0 | 676 |
| 5.0 | 676 |
| 5.0 | 676 |
| 5.0 | 676 |
| 5.0 | 676 |
| 5.0 | 676 |
| 5.0 | 676 |
| 5.0 | 676 |
| 5.0 | 676 |
| 5.0 | 676 |
| 5.0 | 676 |
| 5.0 | 676 |
| 5.0 | 676 |
| 5.0 | 676 |
| 5.0 | 676 |
| 5.0 | 676 |
| 5.0 | 676 |
| 5.0 | 676 |
| 5.0 | 676 |
| 5.0 | 676 |
| 5.0 | 676 |
| 5.0 | 676 |
| 5.0 | 676 |
| 5.0 | 676 |
| 5.0 | 676 |
| 5.0 | 676 |
| 5.0 | 676 |
| 5.0 | 676 |
| 5.0 | 676 |
| 5.0 | 676 |
| 5.0 | 676 |
| 5.0 | 676 |
| 5.0 | 676 |
| 5.0 | 676 |
| 5.0 | 676 |
| 5.0 | 676 |
| 5.0 | 676 |
| 5.0 | 676 |
| 5.0 | 676 |
| 5.0 | 676 |
| 5.0 | 676 |
| 5.0 | 676 |
| 5.0 | 676 |
| 5.0 | 676 |
| 5.0 | 676 |
| 5.0 | 676 |
| 5.0 | 676 |
| 5.0 | 676 |
| 5.0 | 676 |
| 5.0 | 676 |
| 5.0 | 676 |
| 5.0 | 676 |
| 5.0 | 676 |
| 5.0 | 676 |
| 5.0 | 676 |
| 5.0 | 676 |
| 5.0 | 676 |
| 5.0 | 676 |
| 5.0 | 676 |
| 5.0 | 676 |
| 5.0 | 676 |
| 5.0 | 676 |
| 5.0 | 676 |
| 5.0 | 676 |
| 5.0 | 676 |
| 5.0 | 676 |
| 5.0 | 676 |
| 5.0 | 676 |
| 5.0 | 676 |
| 5.0 | 676 |
| 5.0 | 676 |
| 5.0 | 676 |
| 5.0 | 676 |
| 5.0 | 676 |
| 5.0 | 676 |
| 5.0 | 676 |
| 5.0 | 676 |
| 5.0 | 676 |
| 5.0 | 676 |
| 5.0 | 676 |
| 5.0 | 676 |
| 5.0 | 676 |
| 5.0 | 676 |
| 5.0 | 676 |
| 5.0 | 676 |
| 5.0 | 676 |
| 5.0 | 676 |
| 5.0 | 676 |
| 5.0 | 676 |
| 5.0 | 676 |
| 5.0 | 676 |
| 5.0 | 676 |
| 5.0 | 676 |
| 5.0 | 676 |
| 5.0 | 676 |
| 5.0 | 676 |
| 5.0 | 676 |
| 5.0 | 676 |
| 5.0 | 676 |
| 5.0 | 676 |
| 5.0 | 676 |
| 5.0 | 676 |
| 5.0 | 676 |
| 5.0 | 676 |
| 5.0 | 676 |
| 5.0 | 676 |
| 5.0 | 676 |
| 5.0 | 676 |
| 5.0 | 676 |
| 5.0 | 676 |
| 5.0 | 676 |
| 5.0 | 676 |
| 5.0 | 676 |
| 5.0 | 676 |
| 5.0 | 676 |
| 5.0 | 676 |
| 5.0 | 676 |
| 5.0 | 676 |
| 5.0 | 676 |
| 5.0 | 676 |
| 5.0 | 676 |
| 5.0 | 676 |
| 5.0 | 676 |
| 5.0 | 676 |
| 5.0 | 676 |
| 5.0 | 676 |
| 5.0 | 676 |
| 5.0 | 676 |
| 5.0 | 676 |
| 5.0 | 676 |
| 5.0 | 676 |
| 5.0 | 676 |
| 5.0 | 676 |
| 5.0 | 676 |
| 5.0 | 676 |
| 5.0 | 676 |
| 5.0 | 676 |
| 5.0 | 676 |
| 5.0 | 676 |
| 5.0 | 676 |
| 5.0 | 676 |
| 5.0 | 676 |
| 5.0 | 676 |
| 5.0 | 676 |
| 5.0 | 676 |
| 5.0 | 676 |
| 5.0 | 676 |
| 5.0 | 676 |
| 5.0 | 676 |
| 5.0 | 676 |
| 5.0 | 676 |
| 5.0 | 676 |
| 5.0 | 676 |
| 5.0 | 676 |
| 5.0 | 676 |
| 5.0 | 676 |
| 5.0 | 676 |
| 5.0 | 676 |
| 5.0 | 676 |
| 5.0 | 676 |
| 5.0 | 676 |
| 5.0 | 676 |
| 5.0 | 676 |
| 5.0 | 676 |
| 5.0 | 676 |
| 5.0 | 676 |
| 5.0 | 676 |
| 5.0 | 676 |
| 5.0 | 676 |
| 5.0 | 676 |
| 5.0 | 676 |
| 5.0 | 676 |
| 5.0 | 676 |
| 5.0 | 676 |
| 5.0 | 676 |
| 5.0 | 676 |
| 5.0 | 676 |
| 5.0 | 676 |
| 5.0 | 676 |
| 5.0 | 676 |
| 5.0 | 676 |
| 5.0 | 676 |
| 5.0 | 676 |
| 5.0 | 676 |
| 5.0 | 676 |
| 5.0 | 676 |
| 5.0 | 676 |
| 5.0 | 676 |
| 5.0 | 676 |
| 5.0 | 676 |
| 5.0 | 676 |
| 5.0 | 676 |
| 5.0 | 676 |
| 5.0 | 676 |
| 5.0 | 676 |
| 5.0 | 676 |
| 5.0 | 676 |
| 5.0 | 676 |
| 5.0 | 676 |
| 5.0 | 676 |
| 5.0 | 676 |
| 5.0 | 676 |
| 5.0 | 676 |
| 5.0 | 676 |
| 5.0 | 676 |
| 5.0 | 676 |
| 5.0 | 676 |
| 5.0 | 676 |
| 5.0 | 676 |
| 5.0 | 676 |
| 5.0 | 676 |
| 5.0 | 676 |
| 5.0 | 676 |
| 5.0 | 676 |
| 5.0 | 676 |
| 5.0 | 676 |
| 5.0 | 676 |
| 5.0 | 676 |
| 5.0 | 676 |
| 5.0 | 676 |
| 5.0 | 676 |
| 5.0 | 676 |
| 5.0 | 676 |
| 5.0 | 676 |
| 4.0 | 854 |
| 4.0 | 854 |
| 4.0 | 854 |
| 4.0 | 854 |
| 4.0 | 854 |
| 4.0 | 854 |
| 4.0 | 854 |
| 4.0 | 854 |
| 4.0 | 854 |
| 4.0 | 854 |
| 4.0 | 854 |
| 4.0 | 854 |
| 4.0 | 854 |
| 4.0 | 854 |
| 4.0 | 854 |
| 4.0 | 854 |
| 4.0 | 854 |
| 4.0 | 854 |
| 4.0 | 854 |
| 4.0 | 854 |
| 4.0 | 854 |
| 4.0 | 854 |
| 4.0 | 854 |
| 4.0 | 854 |
| 4.0 | 854 |
| 4.0 | 854 |
| 4.0 | 854 |
| 4.0 | 854 |
| 4.0 | 854 |
| 4.0 | 854 |
| 4.0 | 854 |
| 4.0 | 854 |
| 4.0 | 854 |
| 4.0 | 854 |
| 4.0 | 854 |
| 4.0 | 854 |
| 4.0 | 854 |
| 4.0 | 854 |
| 4.0 | 854 |
| 4.0 | 854 |
| 4.0 | 854 |
| 4.0 | 854 |
| 4.0 | 854 |
| 4.0 | 854 |
| 4.0 | 854 |
| 4.0 | 854 |
| 4.0 | 854 |
| 4.0 | 854 |
| 4.0 | 854 |
| 4.0 | 854 |
| 4.0 | 854 |
| 4.0 | 854 |
| 4.0 | 854 |
| 4.0 | 854 |
| 4.0 | 854 |
| 4.0 | 854 |
| 4.0 | 854 |
| 4.0 | 854 |
| 4.0 | 854 |
| 4.0 | 854 |
| 4.0 | 854 |
| 4.0 | 854 |
| 4.0 | 854 |
| 4.0 | 854 |
| 4.0 | 854 |
| 4.0 | 854 |
| 4.0 | 854 |
| 4.0 | 854 |
| 4.0 | 854 |
| 4.0 | 854 |
| 4.0 | 854 |
| 4.0 | 854 |
| 4.0 | 854 |
| 4.0 | 854 |
| 4.0 | 854 |
| 4.0 | 854 |
| 4.0 | 854 |
| 4.0 | 854 |
| 4.0 | 854 |
| 4.0 | 854 |
| 4.0 | 854 |
| 4.0 | 854 |
| 4.0 | 854 |
| 4.0 | 854 |
| 4.0 | 854 |
| 4.0 | 854 |
| 4.0 | 854 |
| 4.0 | 854 |
| 4.0 | 854 |
| 4.0 | 854 |
| 4.0 | 854 |
| 4.0 | 854 |
| 4.0 | 854 |
| 4.0 | 854 |
| 4.0 | 854 |
| 4.0 | 854 |
| 4.0 | 854 |
| 4.0 | 854 |
| 4.0 | 854 |
| 4.0 | 854 |
| 4.0 | 854 |
| 4.0 | 854 |
| 4.0 | 854 |
| 4.0 | 854 |
| 4.0 | 854 |
| 4.0 | 854 |
| 4.0 | 854 |
| 4.0 | 854 |
| 4.0 | 854 |
| 4.0 | 854 |
| 4.0 | 854 |
| 4.0 | 854 |
| 4.0 | 854 |
| 4.0 | 854 |
| 4.0 | 854 |
| 4.0 | 854 |
| 4.0 | 854 |
| 4.0 | 854 |
| 4.0 | 854 |
| 4.0 | 854 |
| 4.0 | 854 |
| 4.0 | 854 |
| 4.0 | 854 |
| 4.0 | 854 |
| 4.0 | 854 |
| 4.0 | 854 |
| 4.0 | 854 |
| 4.0 | 854 |
| 4.0 | 854 |
| 4.0 | 854 |
| 4.0 | 854 |
| 4.0 | 854 |
| 4.0 | 854 |
| 4.0 | 854 |
| 4.0 | 854 |
| 4.0 | 854 |
| 4.0 | 854 |
| 4.0 | 854 |
| 4.0 | 854 |
| 4.0 | 854 |
| 4.0 | 854 |
| 4.0 | 854 |
| 4.0 | 854 |
| 4.0 | 854 |
| 4.0 | 854 |
| 4.0 | 854 |
| 4.0 | 854 |
| 4.0 | 854 |
| 4.0 | 854 |
| 4.0 | 854 |
| 4.0 | 854 |
| 4.0 | 854 |
| 4.0 | 854 |
| 4.0 | 854 |
| 4.0 | 854 |
| 4.0 | 854 |
| 4.0 | 854 |
| 4.0 | 854 |
| 4.0 | 854 |
| 4.0 | 854 |
| 4.0 | 854 |
| 4.0 | 854 |
| 4.0 | 854 |
| 4.0 | 854 |
| 4.0 | 854 |
| 4.0 | 854 |
| 4.0 | 854 |
| 4.0 | 854 |
| 4.0 | 854 |
| 4.0 | 854 |
| 4.0 | 854 |
| 4.0 | 854 |
| 4.0 | 854 |
| 4.0 | 854 |
| 4.0 | 854 |
| 4.0 | 854 |
| 4.0 | 854 |
| 4.0 | 854 |
| 4.0 | 854 |
| 4.0 | 854 |
| 4.0 | 854 |
| 4.0 | 854 |
| 4.0 | 854 |
| 4.0 | 854 |
| 4.0 | 854 |
| 4.0 | 854 |
| 4.0 | 854 |
| 4.0 | 854 |
| 4.0 | 854 |
| 4.0 | 854 |
| 4.0 | 854 |
| 4.0 | 854 |
| 4.0 | 854 |
| 4.0 | 854 |
| 4.0 | 854 |
| 4.0 | 854 |
| 4.0 | 854 |
| 4.0 | 854 |
| 4.0 | 854 |
| 4.0 | 854 |
| 4.0 | 854 |
| 4.0 | 854 |
| 4.0 | 854 |
| 4.0 | 854 |
| 4.0 | 854 |
| 4.0 | 854 |
| 4.0 | 854 |
| 4.0 | 854 |
| 4.0 | 854 |
| 4.0 | 854 |
| 4.0 | 854 |
| 4.0 | 854 |
| 4.0 | 854 |
| 4.0 | 854 |
| 4.0 | 854 |
| 4.0 | 854 |
| 4.0 | 854 |
| 4.0 | 854 |
| 4.0 | 854 |
| 4.0 | 854 |
| 4.0 | 854 |
| 4.0 | 854 |
| 4.0 | 854 |
| 4.0 | 854 |
| 4.0 | 854 |
| 4.0 | 854 |
| 4.0 | 854 |
| 4.0 | 854 |
| 4.0 | 854 |
| 4.0 | 854 |
| 4.0 | 854 |
| 4.0 | 854 |
| 4.0 | 854 |
| 4.0 | 854 |
| 4.0 | 854 |
| 4.0 | 854 |
| 4.0 | 854 |
| 4.0 | 854 |
| 4.0 | 854 |
| 4.0 | 854 |
| 4.0 | 854 |
| 4.0 | 854 |
| 4.0 | 854 |
| 4.0 | 854 |
| 4.0 | 854 |
| 4.0 | 854 |
| 4.0 | 854 |
| 4.0 | 854 |
| 4.0 | 854 |
| 4.0 | 854 |
| 4.0 | 854 |
| 4.0 | 854 |
| 4.0 | 854 |
| 4.0 | 854 |
| 4.0 | 854 |
| 4.0 | 854 |
| 4.0 | 854 |
| 4.0 | 854 |
| 4.0 | 854 |
| 4.0 | 854 |
| 4.0 | 854 |
| 4.0 | 854 |
| 4.0 | 854 |
| 4.0 | 854 |
| 4.0 | 854 |
| 4.0 | 854 |
| 4.0 | 854 |
| 4.0 | 854 |
| 4.0 | 854 |
| 4.0 | 854 |
| 4.0 | 854 |
| 4.0 | 854 |
| 4.0 | 854 |
| 4.0 | 854 |
| 4.0 | 854 |
| 4.0 | 854 |
| 4.0 | 854 |
| 4.0 | 854 |
| 4.0 | 854 |
| 4.0 | 854 |
| 4.0 | 854 |
| 4.0 | 854 |
| 4.0 | 854 |
| 4.0 | 854 |
| 4.0 | 854 |
| 4.0 | 854 |
| 4.0 | 854 |
| 4.0 | 854 |
| 4.0 | 854 |
| 4.0 | 854 |
| 4.0 | 854 |
| 4.0 | 854 |
| 4.0 | 854 |
| 4.0 | 854 |
| 4.0 | 854 |
| 4.0 | 854 |
| 4.0 | 854 |
| 4.0 | 854 |
| 4.0 | 854 |
| 4.0 | 854 |
| 4.0 | 854 |
| 4.0 | 854 |
| 4.0 | 854 |
| 4.0 | 854 |
| 4.0 | 854 |
| 4.0 | 854 |
| 4.0 | 854 |
| 4.0 | 854 |
| 4.0 | 854 |
| 4.0 | 854 |
| 4.0 | 854 |
| 4.0 | 854 |
| 4.0 | 854 |
| 4.0 | 854 |
| 4.0 | 854 |
| 4.0 | 854 |
| 4.0 | 854 |
| 4.0 | 854 |
| 4.0 | 854 |
| 4.0 | 854 |
| 4.0 | 854 |
| 4.0 | 854 |
| 4.0 | 854 |
| 4.0 | 854 |
| 4.0 | 854 |
| 4.0 | 854 |
| 4.0 | 854 |
| 4.0 | 854 |
| 4.0 | 854 |
| 4.0 | 854 |
| 4.0 | 854 |
| 4.0 | 854 |
| 4.0 | 854 |
| 4.0 | 854 |
| 4.0 | 854 |
| 4.0 | 854 |
| 4.0 | 854 |
| 4.0 | 854 |
| 4.0 | 854 |
| 4.0 | 854 |
| 4.0 | 854 |
| 4.0 | 854 |
| 4.0 | 854 |
| 4.0 | 854 |
| 4.0 | 854 |
| 4.0 | 854 |
| 4.0 | 854 |
| 4.0 | 854 |
| 4.0 | 854 |
| 4.0 | 854 |
| 4.0 | 854 |
| 4.0 | 854 |
| 4.0 | 854 |
| 4.0 | 854 |
| 4.0 | 854 |
| 4.0 | 854 |
| 4.0 | 854 |
| 4.0 | 854 |
| 4.0 | 854 |
| 4.0 | 854 |
| 4.0 | 854 |
| 4.0 | 854 |
| 4.0 | 854 |
| 4.0 | 854 |
| 4.0 | 854 |
| 4.0 | 854 |
| 4.0 | 854 |
| 4.0 | 854 |
| 4.0 | 854 |
| 4.0 | 854 |
| 4.0 | 854 |
| 4.0 | 854 |
| 4.0 | 854 |
| 4.0 | 854 |
| 4.0 | 854 |
| 4.0 | 854 |
| 4.0 | 854 |
| 4.0 | 854 |
| 4.0 | 854 |
| 4.0 | 854 |
| 4.0 | 854 |
| 4.0 | 854 |
| 4.0 | 854 |
| 4.0 | 854 |
| 4.0 | 854 |
| 4.0 | 854 |
| 4.0 | 854 |
| 4.0 | 854 |
| 4.0 | 854 |
| 4.0 | 854 |
| 4.0 | 854 |
| 4.0 | 854 |
| 4.0 | 854 |
| 4.0 | 854 |
| 4.0 | 854 |
| 4.0 | 854 |
| 4.0 | 854 |
| 4.0 | 854 |
| 4.0 | 854 |
| 4.0 | 854 |
| 4.0 | 854 |
| 4.0 | 854 |
| 4.0 | 854 |
| 4.0 | 854 |
| 4.0 | 854 |
| 4.0 | 854 |
| 4.0 | 854 |
| 4.0 | 854 |
| 4.0 | 854 |
| 4.0 | 854 |
| 4.0 | 854 |
| 4.0 | 854 |
| 4.0 | 854 |
| 4.0 | 854 |
| 4.0 | 854 |
| 4.0 | 854 |
| 4.0 | 854 |
| 4.0 | 854 |
| 4.0 | 854 |
| 4.0 | 854 |
| 4.0 | 854 |
| 4.0 | 854 |
| 4.0 | 854 |
| 4.0 | 854 |
| 4.0 | 854 |
| 4.0 | 854 |
| 4.0 | 854 |
| 4.0 | 854 |
| 4.0 | 854 |
| 4.0 | 854 |
| 4.0 | 854 |
| 4.0 | 854 |
| 4.0 | 854 |
| 4.0 | 854 |
| 4.0 | 854 |
| 4.0 | 854 |
| 4.0 | 854 |
| 4.0 | 854 |
| 4.0 | 854 |
| 4.0 | 854 |
| 4.0 | 854 |
| 4.0 | 854 |
| 4.0 | 854 |
| 4.0 | 854 |
| 4.0 | 854 |
| 4.0 | 854 |
| 4.0 | 854 |
| 4.0 | 854 |
| 4.0 | 854 |
| 4.0 | 854 |
| 4.0 | 854 |
| 4.0 | 854 |
| 4.0 | 854 |
| 4.0 | 854 |
| 4.0 | 854 |
| 4.0 | 854 |
| 4.0 | 854 |
| 4.0 | 854 |
| 4.0 | 854 |
| 4.0 | 854 |
| 4.0 | 854 |
| 4.0 | 854 |
| 4.0 | 854 |
| 4.0 | 854 |
| 4.0 | 854 |
| 4.0 | 854 |
| 4.0 | 854 |
| 4.0 | 854 |
| 4.0 | 854 |
| 4.0 | 854 |
| 4.0 | 854 |
| 4.0 | 854 |
| 4.0 | 854 |
| 4.0 | 854 |
| 4.0 | 854 |
| 4.0 | 854 |
| 4.0 | 854 |
| 4.0 | 854 |
| 4.0 | 854 |
| 4.0 | 854 |
| 4.0 | 854 |
| 4.0 | 854 |
| 4.0 | 854 |
| 4.0 | 854 |
| 4.0 | 854 |
| 4.0 | 854 |
| 4.0 | 854 |
| 4.0 | 854 |
| 4.0 | 854 |
| 4.0 | 854 |
| 4.0 | 854 |
| 4.0 | 854 |
| 4.0 | 854 |
| 4.0 | 854 |
| 4.0 | 854 |
| 4.0 | 854 |
| 4.0 | 854 |
| 4.0 | 854 |
| 4.0 | 854 |
| 4.0 | 854 |
| 4.0 | 854 |
| 4.0 | 854 |
| 4.0 | 854 |
| 4.0 | 854 |
| 4.0 | 854 |
| 4.0 | 854 |
| 4.0 | 854 |
| 4.0 | 854 |
| 4.0 | 854 |
| 4.0 | 854 |
| 4.0 | 854 |
| 4.0 | 854 |
| 4.0 | 854 |
| 4.0 | 854 |
| 4.0 | 854 |
| 4.0 | 854 |
| 4.0 | 854 |
| 4.0 | 854 |
| 4.0 | 854 |
| 4.0 | 854 |
| 4.0 | 854 |
| 4.0 | 854 |
| 4.0 | 854 |
| 4.0 | 854 |
| 4.0 | 854 |
| 4.0 | 854 |
| 4.0 | 854 |
| 4.0 | 854 |
| 4.0 | 854 |
| 4.0 | 854 |
| 4.0 | 854 |
| 4.0 | 854 |
| 4.0 | 854 |
| 4.0 | 854 |
| 4.0 | 854 |
| 4.0 | 854 |
| 4.0 | 854 |
| 4.0 | 854 |
| 4.0 | 854 |
| 4.0 | 854 |
| 4.0 | 854 |
| 4.0 | 854 |
| 4.0 | 854 |
| 4.0 | 854 |
| 4.0 | 854 |
| 4.0 | 854 |
| 4.0 | 854 |
| 4.0 | 854 |
| 4.0 | 854 |
| 4.0 | 854 |
| 4.0 | 854 |
| 4.0 | 854 |
| 4.0 | 854 |
| 4.0 | 854 |
| 4.0 | 854 |
| 4.0 | 854 |
| 4.0 | 854 |
| 4.0 | 854 |
| 4.0 | 854 |
| 4.0 | 854 |
| 4.0 | 854 |
| 4.0 | 854 |
| 4.0 | 854 |
| 4.0 | 854 |
| 4.0 | 854 |
| 4.0 | 854 |
| 4.0 | 854 |
| 4.0 | 854 |
| 4.0 | 854 |
| 4.0 | 854 |
| 4.0 | 854 |
| 4.0 | 854 |
| 4.0 | 854 |
| 4.0 | 854 |
| 4.0 | 854 |
| 4.0 | 854 |
| 4.0 | 854 |
| 4.0 | 854 |
| 4.0 | 854 |
| 4.0 | 854 |
| 4.0 | 854 |
| 4.0 | 854 |
| 4.0 | 854 |
| 4.0 | 854 |
| 4.0 | 854 |
| 4.0 | 854 |
| 4.0 | 854 |
| 4.0 | 854 |
| 4.0 | 854 |
| 4.0 | 854 |
| 4.0 | 854 |
| 4.0 | 854 |
| 4.0 | 854 |
| 4.0 | 854 |
| 4.0 | 854 |
| 4.0 | 854 |
| 4.0 | 854 |
| 4.0 | 854 |
| 4.0 | 854 |
| 4.0 | 854 |
| 4.0 | 854 |
| 4.0 | 854 |
| 4.0 | 854 |
| 4.0 | 854 |
| 4.0 | 854 |
| 4.0 | 854 |
| 4.0 | 854 |
| 4.0 | 854 |
| 4.0 | 854 |
| 4.0 | 854 |
| 4.0 | 854 |
| 4.0 | 854 |
| 4.0 | 854 |
| 4.0 | 854 |
| 4.0 | 854 |
| 4.0 | 854 |
| 4.0 | 854 |
| 4.0 | 854 |
| 4.0 | 854 |
| 4.0 | 854 |
| 4.0 | 854 |
| 4.0 | 854 |
| 4.0 | 854 |
| 4.0 | 854 |
| 4.0 | 854 |
| 4.0 | 854 |
| 4.0 | 854 |
| 4.0 | 854 |
| 4.0 | 854 |
| 4.0 | 854 |
| 4.0 | 854 |
| 4.0 | 854 |
| 4.0 | 854 |
| 4.0 | 854 |
| 4.0 | 854 |
| 4.0 | 854 |
| 4.0 | 854 |
| 4.0 | 854 |
| 4.0 | 854 |
| 4.0 | 854 |
| 4.0 | 854 |
| 4.0 | 854 |
| 4.0 | 854 |
| 4.0 | 854 |
| 4.0 | 854 |
| 4.0 | 854 |
| 4.0 | 854 |
| 4.0 | 854 |
| 4.0 | 854 |
| 4.0 | 854 |
| 4.0 | 854 |
| 4.0 | 854 |
| 4.0 | 854 |
| 4.0 | 854 |
| 4.0 | 854 |
| 4.0 | 854 |
| 4.0 | 854 |
| 4.0 | 854 |
| 4.0 | 854 |
| 4.0 | 854 |
| 4.0 | 854 |
| 4.0 | 854 |
| 4.0 | 854 |
| 4.0 | 854 |
| 4.0 | 854 |
| 4.0 | 854 |
| 4.0 | 854 |
| 4.0 | 854 |
| 4.0 | 854 |
| 4.0 | 854 |
| 4.0 | 854 |
| 4.0 | 854 |
| 4.0 | 854 |
| 4.0 | 854 |
| 4.0 | 854 |
| 4.0 | 854 |
| 4.0 | 854 |
| 4.0 | 854 |
| 4.0 | 854 |
| 4.0 | 854 |
| 4.0 | 854 |
| 4.0 | 854 |
| 4.0 | 854 |
| 4.0 | 854 |
| 4.0 | 854 |
| 4.0 | 854 |
| 4.0 | 854 |
| 4.0 | 854 |
| 4.0 | 854 |
| 4.0 | 854 |
| 4.0 | 854 |
| 4.0 | 854 |
| 4.0 | 854 |
| 4.0 | 854 |
| 4.0 | 854 |
| 4.0 | 854 |
| 4.0 | 854 |
| 4.0 | 854 |
| 4.0 | 854 |
| 4.0 | 854 |
| 4.0 | 854 |
| 4.0 | 854 |
| 4.0 | 854 |
| 4.0 | 854 |
| 4.0 | 854 |
| 4.0 | 854 |
| 4.0 | 854 |
| 4.0 | 854 |
| 4.0 | 854 |
| 4.0 | 854 |
| 4.0 | 854 |
| 4.0 | 854 |
| 4.0 | 854 |
| 4.0 | 854 |
| 4.0 | 854 |
| 4.0 | 854 |
| 4.0 | 854 |
| 4.0 | 854 |
| 4.0 | 854 |
| 4.0 | 854 |
| 4.0 | 854 |
| 4.0 | 854 |
| 4.0 | 854 |
| 4.0 | 854 |
| 4.0 | 854 |
| 4.0 | 854 |
| 4.0 | 854 |
| 4.0 | 854 |
| 4.0 | 854 |
| 4.0 | 854 |
| 4.0 | 854 |
| 4.0 | 854 |
| 4.0 | 854 |
| 4.0 | 854 |
| 4.0 | 854 |
| 4.0 | 854 |
| 4.0 | 854 |
| 4.0 | 854 |
| 4.0 | 854 |
| 4.0 | 854 |
| 4.0 | 854 |
| 4.0 | 854 |
| 4.0 | 854 |
| 4.0 | 854 |
| 4.0 | 854 |
| 4.0 | 854 |
| 4.0 | 854 |
| 4.0 | 854 |
| 4.0 | 854 |
| 4.0 | 854 |
| 4.0 | 854 |
| 4.0 | 854 |
| 4.0 | 854 |
| 4.0 | 854 |
| 4.0 | 854 |
| 4.0 | 854 |
| 4.0 | 854 |
| 4.0 | 854 |
| 4.0 | 854 |
| 4.0 | 854 |
| 4.0 | 854 |
| 4.0 | 854 |
| 4.0 | 854 |
| 4.0 | 854 |
| 4.0 | 854 |
| 4.0 | 854 |
| 4.0 | 854 |
| 4.0 | 854 |
| 4.0 | 854 |
| 4.0 | 854 |
| 4.0 | 854 |
| 4.0 | 854 |
| 4.0 | 854 |
| 4.0 | 854 |
| 4.0 | 854 |
| 4.0 | 854 |
| 4.0 | 854 |
| 4.0 | 854 |
| 4.0 | 854 |
| 4.0 | 854 |
| 4.0 | 854 |
| 4.0 | 854 |
| 4.0 | 854 |
| 4.0 | 854 |
| 4.0 | 854 |
| 4.0 | 854 |
| 4.0 | 854 |
| 4.0 | 854 |
| 4.0 | 854 |
| 4.0 | 854 |
| 4.0 | 854 |
| 4.0 | 854 |
| 4.0 | 854 |
| 4.0 | 854 |
| 4.0 | 854 |
| 4.0 | 854 |
| 4.0 | 854 |
| 4.0 | 854 |
| 4.0 | 854 |
| 4.0 | 854 |
| 4.0 | 854 |
| 4.0 | 854 |
| 4.0 | 854 |
| 4.0 | 854 |
| 4.0 | 854 |
| 4.0 | 854 |
| 4.0 | 854 |
| 4.0 | 854 |
| 4.0 | 854 |
| 4.0 | 854 |
| 4.0 | 854 |
| 4.0 | 854 |
| 4.0 | 854 |
| 4.0 | 854 |
| 4.0 | 854 |
| 4.0 | 854 |
| 4.0 | 854 |
| 4.0 | 854 |
| 4.0 | 854 |
| 4.0 | 854 |
| 4.0 | 854 |
| 4.0 | 854 |
| 4.0 | 854 |
| 4.0 | 854 |
| 4.0 | 854 |
| 4.0 | 854 |
| 4.0 | 854 |
| 4.0 | 854 |
| 4.0 | 854 |
| 4.0 | 854 |
| 4.0 | 854 |
| 4.0 | 854 |
| 4.0 | 854 |
| 4.0 | 854 |
| 4.0 | 854 |
| 4.0 | 854 |
| 4.0 | 854 |
| 4.0 | 854 |
| 4.0 | 854 |
| 4.0 | 854 |
| 4.0 | 854 |
| 4.0 | 854 |
| 4.0 | 854 |
| 4.0 | 854 |
| 4.0 | 854 |
| 4.0 | 854 |
| 4.0 | 854 |
| 4.0 | 854 |
| 4.0 | 854 |
| 4.0 | 854 |
| 4.0 | 854 |
| 4.0 | 854 |
| 4.0 | 854 |
| 4.0 | 854 |
| 3.0 | 905 |
| 3.0 | 905 |
| 3.0 | 905 |
| 3.0 | 905 |
| 3.0 | 905 |
| 3.0 | 905 |
| 3.0 | 905 |
| 3.0 | 905 |
| 3.0 | 905 |
| 3.0 | 905 |
| 3.0 | 905 |
| 3.0 | 905 |
| 3.0 | 905 |
| 3.0 | 905 |
| 3.0 | 905 |
| 3.0 | 905 |
| 3.0 | 905 |
| 3.0 | 905 |
| 3.0 | 905 |
| 3.0 | 905 |
| 3.0 | 905 |
| 3.0 | 905 |
| 3.0 | 905 |
| 3.0 | 905 |
| 3.0 | 905 |
| 3.0 | 905 |
| 3.0 | 905 |
| 3.0 | 905 |
| 3.0 | 905 |
| 3.0 | 905 |
| 3.0 | 905 |
| 3.0 | 905 |
| 3.0 | 905 |
| 3.0 | 905 |
| 3.0 | 905 |
| 3.0 | 905 |
| 3.0 | 905 |
| 3.0 | 905 |
| 3.0 | 905 |
| 3.0 | 905 |
| 3.0 | 905 |
| 3.0 | 905 |
| 3.0 | 905 |
| 3.0 | 905 |
| 3.0 | 905 |
| 3.0 | 905 |
| 3.0 | 905 |
| 3.0 | 905 |
| 3.0 | 905 |
| 3.0 | 905 |
| 3.0 | 905 |
| 3.0 | 905 |
| 3.0 | 905 |
| 3.0 | 905 |
| 3.0 | 905 |
| 3.0 | 905 |
| 3.0 | 905 |
| 3.0 | 905 |
| 3.0 | 905 |
| 3.0 | 905 |
| 3.0 | 905 |
| 3.0 | 905 |
| 3.0 | 905 |
| 3.0 | 905 |
| 3.0 | 905 |
| 3.0 | 905 |
| 3.0 | 905 |
| 3.0 | 905 |
| 3.0 | 905 |
| 3.0 | 905 |
| 3.0 | 905 |
| 3.0 | 905 |
| 3.0 | 905 |
| 3.0 | 905 |
| 3.0 | 905 |
| 3.0 | 905 |
| 3.0 | 905 |
| 3.0 | 905 |
| 3.0 | 905 |
| 3.0 | 905 |
| 3.0 | 905 |
| 3.0 | 905 |
| 3.0 | 905 |
| 3.0 | 905 |
| 3.0 | 905 |
| 3.0 | 905 |
| 3.0 | 905 |
| 3.0 | 905 |
| 3.0 | 905 |
| 3.0 | 905 |
| 3.0 | 905 |
| 3.0 | 905 |
| 3.0 | 905 |
| 3.0 | 905 |
| 3.0 | 905 |
| 3.0 | 905 |
| 3.0 | 905 |
| 3.0 | 905 |
| 3.0 | 905 |
| 3.0 | 905 |
| 3.0 | 905 |
| 3.0 | 905 |
| 3.0 | 905 |
| 3.0 | 905 |
| 3.0 | 905 |
| 3.0 | 905 |
| 3.0 | 905 |
| 3.0 | 905 |
| 3.0 | 905 |
| 3.0 | 905 |
| 3.0 | 905 |
| 3.0 | 905 |
| 3.0 | 905 |
| 3.0 | 905 |
| 3.0 | 905 |
| 3.0 | 905 |
| 3.0 | 905 |
| 3.0 | 905 |
| 3.0 | 905 |
| 3.0 | 905 |
| 3.0 | 905 |
| 3.0 | 905 |
| 3.0 | 905 |
| 3.0 | 905 |
| 3.0 | 905 |
| 3.0 | 905 |
| 3.0 | 905 |
| 3.0 | 905 |
| 3.0 | 905 |
| 3.0 | 905 |
| 3.0 | 905 |
| 3.0 | 905 |
| 3.0 | 905 |
| 3.0 | 905 |
| 3.0 | 905 |
| 3.0 | 905 |
| 3.0 | 905 |
| 3.0 | 905 |
| 3.0 | 905 |
| 3.0 | 905 |
| 3.0 | 905 |
| 3.0 | 905 |
| 3.0 | 905 |
| 3.0 | 905 |
| 3.0 | 905 |
| 3.0 | 905 |
| 3.0 | 905 |
| 3.0 | 905 |
| 3.0 | 905 |
| 3.0 | 905 |
| 3.0 | 905 |
| 3.0 | 905 |
| 3.0 | 905 |
| 3.0 | 905 |
| 3.0 | 905 |
| 3.0 | 905 |
| 3.0 | 905 |
| 3.0 | 905 |
| 3.0 | 905 |
| 3.0 | 905 |
| 3.0 | 905 |
| 3.0 | 905 |
| 3.0 | 905 |
| 3.0 | 905 |
| 3.0 | 905 |
| 3.0 | 905 |
| 3.0 | 905 |
| 3.0 | 905 |
| 3.0 | 905 |
| 3.0 | 905 |
| 3.0 | 905 |
| 3.0 | 905 |
| 3.0 | 905 |
| 3.0 | 905 |
| 3.0 | 905 |
| 3.0 | 905 |
| 3.0 | 905 |
| 3.0 | 905 |
| 3.0 | 905 |
| 3.0 | 905 |
| 3.0 | 905 |
| 3.0 | 905 |
| 3.0 | 905 |
| 3.0 | 905 |
| 3.0 | 905 |
| 3.0 | 905 |
| 3.0 | 905 |
| 3.0 | 905 |
| 3.0 | 905 |
| 3.0 | 905 |
| 3.0 | 905 |
| 3.0 | 905 |
| 3.0 | 905 |
| 3.0 | 905 |
| 3.0 | 905 |
| 3.0 | 905 |
| 3.0 | 905 |
| 3.0 | 905 |
| 3.0 | 905 |
| 3.0 | 905 |
| 3.0 | 905 |
| 3.0 | 905 |
| 3.0 | 905 |
| 3.0 | 905 |
| 3.0 | 905 |
| 3.0 | 905 |
| 3.0 | 905 |
| 3.0 | 905 |
| 3.0 | 905 |
| 3.0 | 905 |
| 3.0 | 905 |
| 3.0 | 905 |
| 3.0 | 905 |
| 3.0 | 905 |
| 3.0 | 905 |
| 3.0 | 905 |
| 3.0 | 905 |
| 3.0 | 905 |
| 3.0 | 905 |
| 3.0 | 905 |
| 3.0 | 905 |
| 3.0 | 905 |
| 3.0 | 905 |
| 3.0 | 905 |
| 3.0 | 905 |
| 3.0 | 905 |
| 3.0 | 905 |
| 3.0 | 905 |
| 3.0 | 905 |
| 3.0 | 905 |
| 3.0 | 905 |
| 3.0 | 905 |
| 3.0 | 905 |
| 3.0 | 905 |
| 3.0 | 905 |
| 3.0 | 905 |
| 3.0 | 905 |
| 3.0 | 905 |
| 3.0 | 905 |
| 3.0 | 905 |
| 3.0 | 905 |
| 3.0 | 905 |
| 3.0 | 905 |
| 3.0 | 905 |
| 3.0 | 905 |
| 3.0 | 905 |
| 3.0 | 905 |
| 3.0 | 905 |
| 3.0 | 905 |
| 3.0 | 905 |
| 3.0 | 905 |
| 3.0 | 905 |
| 3.0 | 905 |
| 3.0 | 905 |
| 3.0 | 905 |
| 3.0 | 905 |
| 3.0 | 905 |
| 3.0 | 905 |
| 3.0 | 905 |
| 3.0 | 905 |
| 3.0 | 905 |
| 3.0 | 905 |
| 3.0 | 905 |
| 3.0 | 905 |
| 3.0 | 905 |
| 3.0 | 905 |
| 3.0 | 905 |
| 3.0 | 905 |
| 3.0 | 905 |
| 3.0 | 905 |
| 3.0 | 905 |
| 3.0 | 905 |
| 3.0 | 905 |
| 3.0 | 905 |
| 3.0 | 905 |
| 3.0 | 905 |
| 3.0 | 905 |
| 3.0 | 905 |
| 3.0 | 905 |
| 3.0 | 905 |
| 3.0 | 905 |
| 3.0 | 905 |
| 3.0 | 905 |
| 3.0 | 905 |
| 3.0 | 905 |
| 3.0 | 905 |
| 3.0 | 905 |
| 3.0 | 905 |
| 3.0 | 905 |
| 3.0 | 905 |
| 3.0 | 905 |
| 3.0 | 905 |
| 3.0 | 905 |
| 3.0 | 905 |
| 3.0 | 905 |
| 3.0 | 905 |
| 3.0 | 905 |
| 3.0 | 905 |
| 3.0 | 905 |
| 3.0 | 905 |
| 3.0 | 905 |
| 3.0 | 905 |
| 3.0 | 905 |
| 3.0 | 905 |
| 3.0 | 905 |
| 3.0 | 905 |
| 3.0 | 905 |
| 3.0 | 905 |
| 3.0 | 905 |
| 3.0 | 905 |
| 3.0 | 905 |
| 3.0 | 905 |
| 3.0 | 905 |
| 3.0 | 905 |
| 3.0 | 905 |
| 3.0 | 905 |
| 3.0 | 905 |
| 3.0 | 905 |
| 3.0 | 905 |
| 3.0 | 905 |
| 3.0 | 905 |
| 3.0 | 905 |
| 3.0 | 905 |
| 3.0 | 905 |
| 3.0 | 905 |
| 3.0 | 905 |
| 3.0 | 905 |
| 3.0 | 905 |
| 3.0 | 905 |
| 3.0 | 905 |
| 3.0 | 905 |
| 3.0 | 905 |
| 3.0 | 905 |
| 3.0 | 905 |
| 3.0 | 905 |
| 3.0 | 905 |
| 3.0 | 905 |
| 3.0 | 905 |
| 3.0 | 905 |
| 3.0 | 905 |
| 3.0 | 905 |
| 3.0 | 905 |
| 3.0 | 905 |
| 3.0 | 905 |
| 3.0 | 905 |
| 3.0 | 905 |
| 3.0 | 905 |
| 3.0 | 905 |
| 3.0 | 905 |
| 3.0 | 905 |
| 3.0 | 905 |
| 3.0 | 905 |
| 3.0 | 905 |
| 3.0 | 905 |
| 3.0 | 905 |
| 3.0 | 905 |
| 3.0 | 905 |
| 3.0 | 905 |
| 3.0 | 905 |
| 3.0 | 905 |
| 3.0 | 905 |
| 3.0 | 905 |
| 3.0 | 905 |
| 3.0 | 905 |
| 3.0 | 905 |
| 3.0 | 905 |
| 3.0 | 905 |
| 3.0 | 905 |
| 3.0 | 905 |
| 3.0 | 905 |
| 3.0 | 905 |
| 3.0 | 905 |
| 3.0 | 905 |
| 3.0 | 905 |
| 3.0 | 905 |
| 3.0 | 905 |
| 3.0 | 905 |
| 3.0 | 905 |
| 3.0 | 905 |
| 3.0 | 905 |
| 3.0 | 905 |
| 3.0 | 905 |
| 3.0 | 905 |
| 3.0 | 905 |
| 3.0 | 905 |
| 3.0 | 905 |
| 3.0 | 905 |
| 3.0 | 905 |
| 3.0 | 905 |
| 3.0 | 905 |
| 3.0 | 905 |
| 3.0 | 905 |
| 3.0 | 905 |
| 3.0 | 905 |
| 3.0 | 905 |
| 3.0 | 905 |
| 3.0 | 905 |
| 3.0 | 905 |
| 3.0 | 905 |
| 3.0 | 905 |
| 3.0 | 905 |
| 3.0 | 905 |
| 3.0 | 905 |
| 3.0 | 905 |
| 3.0 | 905 |
| 3.0 | 905 |
| 3.0 | 905 |
| 3.0 | 905 |
| 3.0 | 905 |
| 3.0 | 905 |
| 3.0 | 905 |
| 3.0 | 905 |
| 3.0 | 905 |
| 3.0 | 905 |
| 3.0 | 905 |
| 3.0 | 905 |
| 3.0 | 905 |
| 3.0 | 905 |
| 3.0 | 905 |
| 3.0 | 905 |
| 3.0 | 905 |
| 3.0 | 905 |
| 3.0 | 905 |
| 3.0 | 905 |
| 3.0 | 905 |
| 3.0 | 905 |
| 3.0 | 905 |
| 3.0 | 905 |
| 3.0 | 905 |
| 3.0 | 905 |
| 3.0 | 905 |
| 3.0 | 905 |
| 3.0 | 905 |
| 3.0 | 905 |
| 3.0 | 905 |
| 3.0 | 905 |
| 3.0 | 905 |
| 3.0 | 905 |
| 3.0 | 905 |
| 3.0 | 905 |
| 3.0 | 905 |
| 3.0 | 905 |
| 3.0 | 905 |
| 3.0 | 905 |
| 3.0 | 905 |
| 3.0 | 905 |
| 3.0 | 905 |
| 3.0 | 905 |
| 3.0 | 905 |
| 3.0 | 905 |
| 3.0 | 905 |
| 3.0 | 905 |
| 3.0 | 905 |
| 3.0 | 905 |
| 3.0 | 905 |
| 3.0 | 905 |
| 3.0 | 905 |
| 3.0 | 905 |
| 3.0 | 905 |
| 3.0 | 905 |
| 3.0 | 905 |
| 3.0 | 905 |
| 3.0 | 905 |
| 3.0 | 905 |
| 3.0 | 905 |
| 3.0 | 905 |
| 3.0 | 905 |
| 3.0 | 905 |
| 3.0 | 905 |
| 3.0 | 905 |
| 3.0 | 905 |
| 3.0 | 905 |
| 3.0 | 905 |
| 3.0 | 905 |
| 3.0 | 905 |
| 3.0 | 905 |
| 3.0 | 905 |
| 3.0 | 905 |
| 3.0 | 905 |
| 3.0 | 905 |
| 3.0 | 905 |
| 3.0 | 905 |
| 3.0 | 905 |
| 3.0 | 905 |
| 3.0 | 905 |
| 3.0 | 905 |
| 3.0 | 905 |
| 3.0 | 905 |
| 3.0 | 905 |
| 3.0 | 905 |
| 3.0 | 905 |
| 3.0 | 905 |
| 3.0 | 905 |
| 3.0 | 905 |
| 3.0 | 905 |
| 3.0 | 905 |
| 3.0 | 905 |
| 3.0 | 905 |
| 3.0 | 905 |
| 3.0 | 905 |
| 3.0 | 905 |
| 3.0 | 905 |
| 3.0 | 905 |
| 3.0 | 905 |
| 3.0 | 905 |
| 3.0 | 905 |
| 3.0 | 905 |
| 3.0 | 905 |
| 3.0 | 905 |
| 3.0 | 905 |
| 3.0 | 905 |
| 3.0 | 905 |
| 3.0 | 905 |
| 3.0 | 905 |
| 3.0 | 905 |
| 3.0 | 905 |
| 3.0 | 905 |
| 3.0 | 905 |
| 3.0 | 905 |
| 3.0 | 905 |
| 3.0 | 905 |
| 3.0 | 905 |
| 3.0 | 905 |
| 3.0 | 905 |
| 3.0 | 905 |
| 3.0 | 905 |
| 3.0 | 905 |
| 3.0 | 905 |
| 3.0 | 905 |
| 3.0 | 905 |
| 3.0 | 905 |
| 3.0 | 905 |
| 3.0 | 905 |
| 3.0 | 905 |
| 3.0 | 905 |
| 3.0 | 905 |
| 3.0 | 905 |
| 3.0 | 905 |
| 3.0 | 905 |
| 3.0 | 905 |
| 3.0 | 905 |
| 3.0 | 905 |
| 3.0 | 905 |
| 3.0 | 905 |
| 3.0 | 905 |
| 3.0 | 905 |
| 3.0 | 905 |
| 3.0 | 905 |
| 3.0 | 905 |
| 3.0 | 905 |
| 3.0 | 905 |
| 3.0 | 905 |
| 3.0 | 905 |
| 3.0 | 905 |
| 3.0 | 905 |
| 3.0 | 905 |
| 3.0 | 905 |
| 3.0 | 905 |
| 3.0 | 905 |
| 3.0 | 905 |
| 3.0 | 905 |
| 3.0 | 905 |
| 3.0 | 905 |
| 3.0 | 905 |
| 3.0 | 905 |
| 3.0 | 905 |
| 3.0 | 905 |
| 3.0 | 905 |
| 3.0 | 905 |
| 3.0 | 905 |
| 3.0 | 905 |
| 3.0 | 905 |
| 3.0 | 905 |
| 3.0 | 905 |
| 3.0 | 905 |
| 3.0 | 905 |
| 3.0 | 905 |
| 3.0 | 905 |
| 3.0 | 905 |
| 3.0 | 905 |
| 3.0 | 905 |
| 3.0 | 905 |
| 3.0 | 905 |
| 3.0 | 905 |
| 3.0 | 905 |
| 3.0 | 905 |
| 3.0 | 905 |
| 3.0 | 905 |
| 3.0 | 905 |
| 3.0 | 905 |
| 3.0 | 905 |
| 3.0 | 905 |
| 3.0 | 905 |
| 3.0 | 905 |
| 3.0 | 905 |
| 3.0 | 905 |
| 3.0 | 905 |
| 3.0 | 905 |
| 3.0 | 905 |
| 3.0 | 905 |
| 3.0 | 905 |
| 3.0 | 905 |
| 3.0 | 905 |
| 3.0 | 905 |
| 3.0 | 905 |
| 3.0 | 905 |
| 3.0 | 905 |
| 3.0 | 905 |
| 3.0 | 905 |
| 3.0 | 905 |
| 3.0 | 905 |
| 3.0 | 905 |
| 3.0 | 905 |
| 3.0 | 905 |
| 3.0 | 905 |
| 3.0 | 905 |
| 3.0 | 905 |
| 3.0 | 905 |
| 3.0 | 905 |
| 3.0 | 905 |
| 3.0 | 905 |
| 3.0 | 905 |
| 3.0 | 905 |
| 3.0 | 905 |
| 3.0 | 905 |
| 3.0 | 905 |
| 3.0 | 905 |
| 3.0 | 905 |
| 3.0 | 905 |
| 3.0 | 905 |
| 3.0 | 905 |
| 3.0 | 905 |
| 3.0 | 905 |
| 3.0 | 905 |
| 3.0 | 905 |
| 3.0 | 905 |
| 3.0 | 905 |
| 3.0 | 905 |
| 3.0 | 905 |
| 3.0 | 905 |
| 3.0 | 905 |
| 3.0 | 905 |
| 3.0 | 905 |
| 3.0 | 905 |
| 3.0 | 905 |
| 3.0 | 905 |
| 3.0 | 905 |
| 3.0 | 905 |
| 3.0 | 905 |
| 3.0 | 905 |
| 3.0 | 905 |
| 3.0 | 905 |
| 3.0 | 905 |
| 3.0 | 905 |
| 3.0 | 905 |
| 3.0 | 905 |
| 3.0 | 905 |
| 3.0 | 905 |
| 3.0 | 905 |
| 3.0 | 905 |
| 3.0 | 905 |
| 3.0 | 905 |
| 3.0 | 905 |
| 3.0 | 905 |
| 3.0 | 905 |
| 3.0 | 905 |
| 3.0 | 905 |
| 3.0 | 905 |
| 3.0 | 905 |
| 3.0 | 905 |
| 3.0 | 905 |
| 3.0 | 905 |
| 3.0 | 905 |
| 3.0 | 905 |
| 3.0 | 905 |
| 3.0 | 905 |
| 3.0 | 905 |
| 3.0 | 905 |
| 3.0 | 905 |
| 3.0 | 905 |
| 3.0 | 905 |
| 3.0 | 905 |
| 3.0 | 905 |
| 3.0 | 905 |
| 3.0 | 905 |
| 3.0 | 905 |
| 3.0 | 905 |
| 3.0 | 905 |
| 3.0 | 905 |
| 3.0 | 905 |
| 3.0 | 905 |
| 3.0 | 905 |
| 3.0 | 905 |
| 3.0 | 905 |
| 3.0 | 905 |
| 3.0 | 905 |
| 3.0 | 905 |
| 3.0 | 905 |
| 3.0 | 905 |
| 3.0 | 905 |
| 3.0 | 905 |
| 3.0 | 905 |
| 3.0 | 905 |
| 3.0 | 905 |
| 3.0 | 905 |
| 3.0 | 905 |
| 3.0 | 905 |
| 3.0 | 905 |
| 3.0 | 905 |
| 3.0 | 905 |
| 3.0 | 905 |
| 3.0 | 905 |
| 3.0 | 905 |
| 3.0 | 905 |
| 3.0 | 905 |
| 3.0 | 905 |
| 3.0 | 905 |
| 3.0 | 905 |
| 3.0 | 905 |
| 3.0 | 905 |
| 3.0 | 905 |
| 3.0 | 905 |
| 3.0 | 905 |
| 3.0 | 905 |
| 3.0 | 905 |
| 3.0 | 905 |
| 3.0 | 905 |
| 3.0 | 905 |
| 3.0 | 905 |
| 3.0 | 905 |
| 3.0 | 905 |
| 3.0 | 905 |
| 3.0 | 905 |
| 3.0 | 905 |
| 3.0 | 905 |
| 3.0 | 905 |
| 3.0 | 905 |
| 3.0 | 905 |
| 3.0 | 905 |
| 3.0 | 905 |
| 3.0 | 905 |
| 3.0 | 905 |
| 3.0 | 905 |
| 3.0 | 905 |
| 3.0 | 905 |
| 3.0 | 905 |
| 3.0 | 905 |
| 3.0 | 905 |
| 3.0 | 905 |
| 3.0 | 905 |
| 3.0 | 905 |
| 3.0 | 905 |
| 3.0 | 905 |
| 3.0 | 905 |
| 3.0 | 905 |
| 3.0 | 905 |
| 3.0 | 905 |
| 3.0 | 905 |
| 3.0 | 905 |
| 3.0 | 905 |
| 3.0 | 905 |
| 3.0 | 905 |
| 3.0 | 905 |
| 3.0 | 905 |
| 3.0 | 905 |
| 3.0 | 905 |
| 3.0 | 905 |
| 3.0 | 905 |
| 3.0 | 905 |
| 3.0 | 905 |
| 3.0 | 905 |
| 3.0 | 905 |
| 3.0 | 905 |
| 3.0 | 905 |
| 3.0 | 905 |
| 3.0 | 905 |
| 3.0 | 905 |
| 3.0 | 905 |
| 3.0 | 905 |
| 3.0 | 905 |
| 3.0 | 905 |
| 3.0 | 905 |
| 3.0 | 905 |
| 3.0 | 905 |
| 3.0 | 905 |
| 3.0 | 905 |
| 3.0 | 905 |
| 3.0 | 905 |
| 3.0 | 905 |
| 3.0 | 905 |
| 3.0 | 905 |
| 3.0 | 905 |
| 3.0 | 905 |
| 3.0 | 905 |
| 3.0 | 905 |
| 3.0 | 905 |
| 3.0 | 905 |
| 3.0 | 905 |
| 3.0 | 905 |
| 3.0 | 905 |
| 3.0 | 905 |
| 3.0 | 905 |
| 3.0 | 905 |
| 3.0 | 905 |
| 3.0 | 905 |
| 3.0 | 905 |
| 3.0 | 905 |
| 3.0 | 905 |
| 3.0 | 905 |
| 3.0 | 905 |
| 3.0 | 905 |
| 3.0 | 905 |
| 3.0 | 905 |
| 3.0 | 905 |
| 3.0 | 905 |
| 3.0 | 905 |
| 3.0 | 905 |
| 3.0 | 905 |
| 3.0 | 905 |
| 3.0 | 905 |
| 3.0 | 905 |
| 3.0 | 905 |
| 3.0 | 905 |
| 3.0 | 905 |
| 3.0 | 905 |
| 3.0 | 905 |
| 3.0 | 905 |
| 3.0 | 905 |
| 3.0 | 905 |
| 3.0 | 905 |
| 3.0 | 905 |
| 3.0 | 905 |
| 3.0 | 905 |
| 3.0 | 905 |
| 3.0 | 905 |
| 3.0 | 905 |
| 3.0 | 905 |
| 3.0 | 905 |
| 3.0 | 905 |
| 3.0 | 905 |
| 3.0 | 905 |
| 3.0 | 905 |
| 3.0 | 905 |
| 3.0 | 905 |
| 3.0 | 905 |
| 3.0 | 905 |
| 3.0 | 905 |
| 3.0 | 905 |
| 3.0 | 905 |
| 3.0 | 905 |
| 3.0 | 905 |
| 3.0 | 905 |
| 3.0 | 905 |
| 3.0 | 905 |
| 3.0 | 905 |
| 3.0 | 905 |
| 3.0 | 905 |
| 3.0 | 905 |
| 3.0 | 905 |
| 3.0 | 905 |
| 3.0 | 905 |
| 3.0 | 905 |
| 3.0 | 905 |
| 3.0 | 905 |
| 3.0 | 905 |
| 3.0 | 905 |
| 3.0 | 905 |
| 3.0 | 905 |
| 3.0 | 905 |
| 3.0 | 905 |
| 3.0 | 905 |
| 3.0 | 905 |
| 3.0 | 905 |
| 3.0 | 905 |
| 3.0 | 905 |
| 3.0 | 905 |
| 3.0 | 905 |
| 3.0 | 905 |
| 3.0 | 905 |
| 3.0 | 905 |
| 3.0 | 905 |
| 3.0 | 905 |
| 3.0 | 905 |
| 3.0 | 905 |
| 3.0 | 905 |
| 3.0 | 905 |
| 3.0 | 905 |
| 3.0 | 905 |
| 3.0 | 905 |
| 3.0 | 905 |
| 3.0 | 905 |
| 3.0 | 905 |
| 3.0 | 905 |
| 3.0 | 905 |
| 3.0 | 905 |
| 3.0 | 905 |
| 3.0 | 905 |
| 3.0 | 905 |
| 3.0 | 905 |
| 3.0 | 905 |
| 3.0 | 905 |
| 3.0 | 905 |
| 3.0 | 905 |
| 3.0 | 905 |
| 3.0 | 905 |
| 2.0 | 976 |
| 2.0 | 976 |
| 2.0 | 976 |
| 2.0 | 976 |
| 2.0 | 976 |
| 2.0 | 976 |
| 2.0 | 976 |
| 2.0 | 976 |
| 2.0 | 976 |
| 2.0 | 976 |
| 2.0 | 976 |
| 2.0 | 976 |
| 2.0 | 976 |
| 2.0 | 976 |
| 2.0 | 976 |
| 2.0 | 976 |
| 2.0 | 976 |
| 2.0 | 976 |
| 2.0 | 976 |
| 2.0 | 976 |
| 2.0 | 976 |
| 2.0 | 976 |
| 2.0 | 976 |
| 2.0 | 976 |
| 2.0 | 976 |
| 2.0 | 976 |
| 2.0 | 976 |
| 2.0 | 976 |
| 2.0 | 976 |
| 2.0 | 976 |
| 2.0 | 976 |
| 2.0 | 976 |
| 2.0 | 976 |
| 2.0 | 976 |
| 2.0 | 976 |
| 2.0 | 976 |
| 2.0 | 976 |
| 2.0 | 976 |
| 2.0 | 976 |
| 2.0 | 976 |
| 2.0 | 976 |
| 2.0 | 976 |
| 2.0 | 976 |
| 2.0 | 976 |
| 2.0 | 976 |
| 2.0 | 976 |
| 2.0 | 976 |
| 2.0 | 976 |
| 2.0 | 976 |
| 2.0 | 976 |
| 2.0 | 976 |
| 2.0 | 976 |
| 2.0 | 976 |
| 2.0 | 976 |
| 2.0 | 976 |
| 2.0 | 976 |
| 2.0 | 976 |
| 2.0 | 976 |
| 2.0 | 976 |
| 2.0 | 976 |
| 2.0 | 976 |
| 2.0 | 976 |
| 2.0 | 976 |
| 2.0 | 976 |
| 2.0 | 976 |
| 2.0 | 976 |
| 2.0 | 976 |
| 2.0 | 976 |
| 2.0 | 976 |
| 2.0 | 976 |
| 2.0 | 976 |
| 2.0 | 976 |
| 2.0 | 976 |
| 2.0 | 976 |
| 2.0 | 976 |
| 2.0 | 976 |
| 2.0 | 976 |
| 2.0 | 976 |
| 2.0 | 976 |
| 2.0 | 976 |
| 2.0 | 976 |
| 2.0 | 976 |
| 2.0 | 976 |
| 2.0 | 976 |
| 2.0 | 976 |
| 2.0 | 976 |
| 2.0 | 976 |
| 2.0 | 976 |
| 2.0 | 976 |
| 2.0 | 976 |
| 2.0 | 976 |
| 2.0 | 976 |
| 2.0 | 976 |
| 2.0 | 976 |
| 2.0 | 976 |
| 2.0 | 976 |
| 2.0 | 976 |
| 2.0 | 976 |
| 2.0 | 976 |
| 2.0 | 976 |
| 2.0 | 976 |
| 2.0 | 976 |
| 2.0 | 976 |
| 2.0 | 976 |
| 2.0 | 976 |
| 2.0 | 976 |
| 2.0 | 976 |
| 2.0 | 976 |
| 2.0 | 976 |
| 2.0 | 976 |
| 2.0 | 976 |
| 2.0 | 976 |
| 2.0 | 976 |
| 2.0 | 976 |
| 2.0 | 976 |
| 2.0 | 976 |
| 2.0 | 976 |
| 2.0 | 976 |
| 2.0 | 976 |
| 2.0 | 976 |
| 2.0 | 976 |
| 2.0 | 976 |
| 2.0 | 976 |
| 2.0 | 976 |
| 2.0 | 976 |
| 2.0 | 976 |
| 2.0 | 976 |
| 2.0 | 976 |
| 2.0 | 976 |
| 2.0 | 976 |
| 2.0 | 976 |
| 2.0 | 976 |
| 2.0 | 976 |
| 2.0 | 976 |
| 2.0 | 976 |
| 2.0 | 976 |
| 2.0 | 976 |
| 2.0 | 976 |
| 2.0 | 976 |
| 2.0 | 976 |
| 2.0 | 976 |
| 2.0 | 976 |
| 2.0 | 976 |
| 2.0 | 976 |
| 2.0 | 976 |
| 2.0 | 976 |
| 2.0 | 976 |
| 2.0 | 976 |
| 2.0 | 976 |
| 2.0 | 976 |
| 2.0 | 976 |
| 2.0 | 976 |
| 2.0 | 976 |
| 2.0 | 976 |
| 2.0 | 976 |
| 2.0 | 976 |
| 2.0 | 976 |
| 2.0 | 976 |
| 2.0 | 976 |
| 2.0 | 976 |
| 2.0 | 976 |
| 2.0 | 976 |
| 2.0 | 976 |
| 2.0 | 976 |
| 2.0 | 976 |
| 2.0 | 976 |
| 2.0 | 976 |
| 2.0 | 976 |
| 2.0 | 976 |
| 2.0 | 976 |
| 2.0 | 976 |
| 2.0 | 976 |
| 2.0 | 976 |
| 2.0 | 976 |
| 2.0 | 976 |
| 2.0 | 976 |
| 2.0 | 976 |
| 2.0 | 976 |
| 2.0 | 976 |
| 2.0 | 976 |
| 2.0 | 976 |
| 2.0 | 976 |
| 2.0 | 976 |
| 2.0 | 976 |
| 2.0 | 976 |
| 2.0 | 976 |
| 2.0 | 976 |
| 2.0 | 976 |
| 2.0 | 976 |
| 2.0 | 976 |
| 2.0 | 976 |
| 2.0 | 976 |
| 2.0 | 976 |
| 2.0 | 976 |
| 2.0 | 976 |
| 2.0 | 976 |
| 2.0 | 976 |
| 2.0 | 976 |
| 2.0 | 976 |
| 2.0 | 976 |
| 2.0 | 976 |
| 2.0 | 976 |
| 2.0 | 976 |
| 2.0 | 976 |
| 2.0 | 976 |
| 2.0 | 976 |
| 2.0 | 976 |
| 2.0 | 976 |
| 2.0 | 976 |
| 2.0 | 976 |
| 2.0 | 976 |
| 2.0 | 976 |
| 2.0 | 976 |
| 2.0 | 976 |
| 2.0 | 976 |
| 2.0 | 976 |
| 2.0 | 976 |
| 2.0 | 976 |
| 2.0 | 976 |
| 2.0 | 976 |
| 2.0 | 976 |
| 2.0 | 976 |
| 2.0 | 976 |
| 2.0 | 976 |
| 2.0 | 976 |
| 2.0 | 976 |
| 2.0 | 976 |
| 2.0 | 976 |
| 2.0 | 976 |
| 2.0 | 976 |
| 2.0 | 976 |
| 2.0 | 976 |
| 2.0 | 976 |
| 2.0 | 976 |
| 2.0 | 976 |
| 2.0 | 976 |
| 2.0 | 976 |
| 2.0 | 976 |
| 2.0 | 976 |
| 2.0 | 976 |
| 2.0 | 976 |
| 2.0 | 976 |
| 2.0 | 976 |
| 2.0 | 976 |
| 2.0 | 976 |
| 2.0 | 976 |
| 2.0 | 976 |
| 2.0 | 976 |
| 2.0 | 976 |
| 2.0 | 976 |
| 2.0 | 976 |
| 2.0 | 976 |
| 2.0 | 976 |
| 2.0 | 976 |
| 2.0 | 976 |
| 2.0 | 976 |
| 2.0 | 976 |
| 2.0 | 976 |
| 2.0 | 976 |
| 2.0 | 976 |
| 2.0 | 976 |
| 2.0 | 976 |
| 2.0 | 976 |
| 2.0 | 976 |
| 2.0 | 976 |
| 2.0 | 976 |
| 2.0 | 976 |
| 2.0 | 976 |
| 2.0 | 976 |
| 2.0 | 976 |
| 2.0 | 976 |
| 2.0 | 976 |
| 2.0 | 976 |
| 2.0 | 976 |
| 2.0 | 976 |
| 2.0 | 976 |
| 2.0 | 976 |
| 2.0 | 976 |
| 2.0 | 976 |
| 2.0 | 976 |
| 2.0 | 976 |
| 2.0 | 976 |
| 2.0 | 976 |
| 2.0 | 976 |
| 2.0 | 976 |
| 2.0 | 976 |
| 2.0 | 976 |
| 2.0 | 976 |
| 2.0 | 976 |
| 2.0 | 976 |
| 2.0 | 976 |
| 2.0 | 976 |
| 2.0 | 976 |
| 2.0 | 976 |
| 2.0 | 976 |
| 2.0 | 976 |
| 2.0 | 976 |
| 2.0 | 976 |
| 2.0 | 976 |
| 2.0 | 976 |
| 2.0 | 976 |
| 2.0 | 976 |
| 2.0 | 976 |
| 2.0 | 976 |
| 2.0 | 976 |
| 2.0 | 976 |
| 2.0 | 976 |
| 2.0 | 976 |
| 2.0 | 976 |
| 2.0 | 976 |
| 2.0 | 976 |
| 2.0 | 976 |
| 2.0 | 976 |
| 2.0 | 976 |
| 2.0 | 976 |
| 2.0 | 976 |
| 2.0 | 976 |
| 2.0 | 976 |
| 2.0 | 976 |
| 2.0 | 976 |
| 2.0 | 976 |
| 2.0 | 976 |
| 2.0 | 976 |
| 2.0 | 976 |
| 2.0 | 976 |
| 2.0 | 976 |
| 2.0 | 976 |
| 2.0 | 976 |
| 2.0 | 976 |
| 2.0 | 976 |
| 2.0 | 976 |
| 2.0 | 976 |
| 2.0 | 976 |
| 2.0 | 976 |
| 2.0 | 976 |
| 2.0 | 976 |
| 2.0 | 976 |
| 2.0 | 976 |
| 2.0 | 976 |
| 2.0 | 976 |
| 2.0 | 976 |
| 2.0 | 976 |
| 2.0 | 976 |
| 2.0 | 976 |
| 2.0 | 976 |
| 2.0 | 976 |
| 2.0 | 976 |
| 2.0 | 976 |
| 2.0 | 976 |
| 2.0 | 976 |
| 2.0 | 976 |
| 2.0 | 976 |
| 2.0 | 976 |
| 2.0 | 976 |
| 2.0 | 976 |
| 2.0 | 976 |
| 2.0 | 976 |
| 2.0 | 976 |
| 2.0 | 976 |
| 2.0 | 976 |
| 2.0 | 976 |
| 2.0 | 976 |
| 2.0 | 976 |
| 2.0 | 976 |
| 2.0 | 976 |
| 2.0 | 976 |
| 2.0 | 976 |
| 2.0 | 976 |
| 2.0 | 976 |
| 2.0 | 976 |
| 2.0 | 976 |
| 2.0 | 976 |
| 2.0 | 976 |
| 2.0 | 976 |
| 2.0 | 976 |
| 2.0 | 976 |
| 2.0 | 976 |
| 2.0 | 976 |
| 2.0 | 976 |
| 2.0 | 976 |
| 2.0 | 976 |
| 2.0 | 976 |
| 2.0 | 976 |
| 2.0 | 976 |
| 2.0 | 976 |
| 2.0 | 976 |
| 2.0 | 976 |
| 2.0 | 976 |
| 2.0 | 976 |
| 2.0 | 976 |
| 2.0 | 976 |
| 2.0 | 976 |
| 2.0 | 976 |
| 2.0 | 976 |
| 2.0 | 976 |
| 2.0 | 976 |
| 2.0 | 976 |
| 2.0 | 976 |
| 2.0 | 976 |
| 2.0 | 976 |
| 2.0 | 976 |
| 2.0 | 976 |
| 2.0 | 976 |
| 2.0 | 976 |
| 2.0 | 976 |
| 2.0 | 976 |
| 2.0 | 976 |
| 2.0 | 976 |
| 2.0 | 976 |
| 2.0 | 976 |
| 2.0 | 976 |
| 2.0 | 976 |
| 2.0 | 976 |
| 2.0 | 976 |
| 2.0 | 976 |
| 2.0 | 976 |
| 2.0 | 976 |
| 2.0 | 976 |
| 2.0 | 976 |
| 2.0 | 976 |
| 2.0 | 976 |
| 2.0 | 976 |
| 2.0 | 976 |
| 2.0 | 976 |
| 2.0 | 976 |
| 2.0 | 976 |
| 2.0 | 976 |
| 2.0 | 976 |
| 2.0 | 976 |
| 2.0 | 976 |
| 2.0 | 976 |
| 2.0 | 976 |
| 2.0 | 976 |
| 2.0 | 976 |
| 2.0 | 976 |
| 2.0 | 976 |
| 2.0 | 976 |
| 2.0 | 976 |
| 2.0 | 976 |
| 2.0 | 976 |
| 2.0 | 976 |
| 2.0 | 976 |
| 2.0 | 976 |
| 2.0 | 976 |
| 2.0 | 976 |
| 2.0 | 976 |
| 2.0 | 976 |
| 2.0 | 976 |
| 2.0 | 976 |
| 2.0 | 976 |
| 2.0 | 976 |
| 2.0 | 976 |
| 2.0 | 976 |
| 2.0 | 976 |
| 2.0 | 976 |
| 2.0 | 976 |
| 2.0 | 976 |
| 2.0 | 976 |
| 2.0 | 976 |
| 2.0 | 976 |
| 2.0 | 976 |
| 2.0 | 976 |
| 2.0 | 976 |
| 2.0 | 976 |
| 2.0 | 976 |
| 2.0 | 976 |
| 2.0 | 976 |
| 2.0 | 976 |
| 2.0 | 976 |
| 2.0 | 976 |
| 2.0 | 976 |
| 2.0 | 976 |
| 2.0 | 976 |
| 2.0 | 976 |
| 2.0 | 976 |
| 2.0 | 976 |
| 2.0 | 976 |
| 2.0 | 976 |
| 2.0 | 976 |
| 2.0 | 976 |
| 2.0 | 976 |
| 2.0 | 976 |
| 2.0 | 976 |
| 2.0 | 976 |
| 2.0 | 976 |
| 2.0 | 976 |
| 2.0 | 976 |
| 2.0 | 976 |
| 2.0 | 976 |
| 2.0 | 976 |
| 2.0 | 976 |
| 2.0 | 976 |
| 2.0 | 976 |
| 2.0 | 976 |
| 2.0 | 976 |
| 2.0 | 976 |
| 2.0 | 976 |
| 2.0 | 976 |
| 2.0 | 976 |
| 2.0 | 976 |
| 2.0 | 976 |
| 2.0 | 976 |
| 2.0 | 976 |
| 2.0 | 976 |
| 2.0 | 976 |
| 2.0 | 976 |
| 2.0 | 976 |
| 2.0 | 976 |
| 2.0 | 976 |
| 2.0 | 976 |
| 2.0 | 976 |
| 2.0 | 976 |
| 2.0 | 976 |
| 2.0 | 976 |
| 2.0 | 976 |
| 2.0 | 976 |
| 2.0 | 976 |
| 2.0 | 976 |
| 2.0 | 976 |
| 2.0 | 976 |
| 2.0 | 976 |
| 2.0 | 976 |
| 2.0 | 976 |
| 2.0 | 976 |
| 2.0 | 976 |
| 2.0 | 976 |
| 2.0 | 976 |
| 2.0 | 976 |
| 2.0 | 976 |
| 2.0 | 976 |
| 2.0 | 976 |
| 2.0 | 976 |
| 2.0 | 976 |
| 2.0 | 976 |
| 2.0 | 976 |
| 2.0 | 976 |
| 2.0 | 976 |
| 2.0 | 976 |
| 2.0 | 976 |
| 2.0 | 976 |
| 2.0 | 976 |
| 2.0 | 976 |
| 2.0 | 976 |
| 2.0 | 976 |
| 2.0 | 976 |
| 2.0 | 976 |
| 2.0 | 976 |
| 2.0 | 976 |
| 2.0 | 976 |
| 2.0 | 976 |
| 2.0 | 976 |
| 2.0 | 976 |
| 2.0 | 976 |
| 2.0 | 976 |
| 2.0 | 976 |
| 2.0 | 976 |
| 2.0 | 976 |
| 2.0 | 976 |
| 2.0 | 976 |
| 2.0 | 976 |
| 2.0 | 976 |
| 2.0 | 976 |
| 2.0 | 976 |
| 2.0 | 976 |
| 2.0 | 976 |
| 2.0 | 976 |
| 2.0 | 976 |
| 2.0 | 976 |
| 2.0 | 976 |
| 2.0 | 976 |
| 2.0 | 976 |
| 2.0 | 976 |
| 2.0 | 976 |
| 2.0 | 976 |
| 2.0 | 976 |
| 2.0 | 976 |
| 2.0 | 976 |
| 2.0 | 976 |
| 2.0 | 976 |
| 2.0 | 976 |
| 2.0 | 976 |
| 2.0 | 976 |
| 2.0 | 976 |
| 2.0 | 976 |
| 2.0 | 976 |
| 2.0 | 976 |
| 2.0 | 976 |
| 2.0 | 976 |
| 2.0 | 976 |
| 2.0 | 976 |
| 2.0 | 976 |
| 2.0 | 976 |
| 2.0 | 976 |
| 2.0 | 976 |
| 2.0 | 976 |
| 2.0 | 976 |
| 2.0 | 976 |
| 2.0 | 976 |
| 2.0 | 976 |
| 2.0 | 976 |
| 2.0 | 976 |
| 2.0 | 976 |
| 2.0 | 976 |
| 2.0 | 976 |
| 2.0 | 976 |
| 2.0 | 976 |
| 2.0 | 976 |
| 2.0 | 976 |
| 2.0 | 976 |
| 2.0 | 976 |
| 2.0 | 976 |
| 2.0 | 976 |
| 2.0 | 976 |
| 2.0 | 976 |
| 2.0 | 976 |
| 2.0 | 976 |
| 2.0 | 976 |
| 2.0 | 976 |
| 2.0 | 976 |
| 2.0 | 976 |
| 2.0 | 976 |
| 2.0 | 976 |
| 2.0 | 976 |
| 2.0 | 976 |
| 2.0 | 976 |
| 2.0 | 976 |
| 2.0 | 976 |
| 2.0 | 976 |
| 2.0 | 976 |
| 2.0 | 976 |
| 2.0 | 976 |
| 2.0 | 976 |
| 2.0 | 976 |
| 2.0 | 976 |
| 2.0 | 976 |
| 2.0 | 976 |
| 2.0 | 976 |
| 2.0 | 976 |
| 2.0 | 976 |
| 2.0 | 976 |
| 2.0 | 976 |
| 2.0 | 976 |
| 2.0 | 976 |
| 2.0 | 976 |
| 2.0 | 976 |
| 2.0 | 976 |
| 2.0 | 976 |
| 2.0 | 976 |
| 2.0 | 976 |
| 2.0 | 976 |
| 2.0 | 976 |
| 2.0 | 976 |
| 2.0 | 976 |
| 2.0 | 976 |
| 2.0 | 976 |
| 2.0 | 976 |
| 2.0 | 976 |
| 2.0 | 976 |
| 2.0 | 976 |
| 2.0 | 976 |
| 2.0 | 976 |
| 2.0 | 976 |
| 2.0 | 976 |
| 2.0 | 976 |
| 2.0 | 976 |
| 2.0 | 976 |
| 2.0 | 976 |
| 2.0 | 976 |
| 2.0 | 976 |
| 2.0 | 976 |
| 2.0 | 976 |
| 2.0 | 976 |
| 2.0 | 976 |
| 2.0 | 976 |
| 2.0 | 976 |
| 2.0 | 976 |
| 2.0 | 976 |
| 2.0 | 976 |
| 2.0 | 976 |
| 2.0 | 976 |
| 2.0 | 976 |
| 2.0 | 976 |
| 2.0 | 976 |
| 2.0 | 976 |
| 2.0 | 976 |
| 2.0 | 976 |
| 2.0 | 976 |
| 2.0 | 976 |
| 2.0 | 976 |
| 2.0 | 976 |
| 2.0 | 976 |
| 2.0 | 976 |
| 2.0 | 976 |
| 2.0 | 976 |
| 2.0 | 976 |
| 2.0 | 976 |
| 2.0 | 976 |
| 2.0 | 976 |
| 2.0 | 976 |
| 2.0 | 976 |
| 2.0 | 976 |
| 2.0 | 976 |
| 2.0 | 976 |
| 2.0 | 976 |
| 2.0 | 976 |
| 2.0 | 976 |
| 2.0 | 976 |
| 2.0 | 976 |
| 2.0 | 976 |
| 2.0 | 976 |
| 2.0 | 976 |
| 2.0 | 976 |
| 2.0 | 976 |
| 2.0 | 976 |
| 2.0 | 976 |
| 2.0 | 976 |
| 2.0 | 976 |
| 2.0 | 976 |
| 2.0 | 976 |
| 2.0 | 976 |
| 2.0 | 976 |
| 2.0 | 976 |
| 2.0 | 976 |
| 2.0 | 976 |
| 2.0 | 976 |
| 2.0 | 976 |
| 2.0 | 976 |
| 2.0 | 976 |
| 2.0 | 976 |
| 2.0 | 976 |
| 2.0 | 976 |
| 2.0 | 976 |
| 2.0 | 976 |
| 2.0 | 976 |
| 2.0 | 976 |
| 2.0 | 976 |
| 2.0 | 976 |
| 2.0 | 976 |
| 2.0 | 976 |
| 2.0 | 976 |
| 2.0 | 976 |
| 2.0 | 976 |
| 2.0 | 976 |
| 2.0 | 976 |
| 2.0 | 976 |
| 2.0 | 976 |
| 2.0 | 976 |
| 2.0 | 976 |
| 2.0 | 976 |
| 2.0 | 976 |
| 2.0 | 976 |
| 2.0 | 976 |
| 2.0 | 976 |
| 2.0 | 976 |
| 2.0 | 976 |
| 2.0 | 976 |
| 2.0 | 976 |
| 2.0 | 976 |
| 2.0 | 976 |
| 2.0 | 976 |
| 2.0 | 976 |
| 2.0 | 976 |
| 2.0 | 976 |
| 2.0 | 976 |
| 2.0 | 976 |
| 2.0 | 976 |
| 2.0 | 976 |
| 2.0 | 976 |
| 2.0 | 976 |
| 2.0 | 976 |
| 2.0 | 976 |
| 2.0 | 976 |
| 2.0 | 976 |
| 2.0 | 976 |
| 2.0 | 976 |
| 2.0 | 976 |
| 2.0 | 976 |
| 2.0 | 976 |
| 2.0 | 976 |
| 2.0 | 976 |
| 2.0 | 976 |
| 2.0 | 976 |
| 2.0 | 976 |
| 2.0 | 976 |
| 2.0 | 976 |
| 2.0 | 976 |
| 2.0 | 976 |
| 2.0 | 976 |
| 2.0 | 976 |
| 2.0 | 976 |
| 2.0 | 976 |
| 2.0 | 976 |
| 2.0 | 976 |
| 2.0 | 976 |
| 2.0 | 976 |
| 2.0 | 976 |
| 2.0 | 976 |
| 2.0 | 976 |
| 2.0 | 976 |
| 2.0 | 976 |
| 2.0 | 976 |
| 2.0 | 976 |
| 2.0 | 976 |
| 2.0 | 976 |
| 2.0 | 976 |
| 2.0 | 976 |
| 2.0 | 976 |
| 2.0 | 976 |
| 2.0 | 976 |
| 2.0 | 976 |
| 2.0 | 976 |
| 2.0 | 976 |
| 2.0 | 976 |
| 2.0 | 976 |
| 2.0 | 976 |
| 2.0 | 976 |
| 2.0 | 976 |
| 2.0 | 976 |
| 2.0 | 976 |
| 2.0 | 976 |
| 2.0 | 976 |
| 2.0 | 976 |
| 2.0 | 976 |
| 2.0 | 976 |
| 2.0 | 976 |
| 2.0 | 976 |
| 2.0 | 976 |
| 2.0 | 976 |
| 2.0 | 976 |
| 2.0 | 976 |
| 2.0 | 976 |
| 2.0 | 976 |
| 2.0 | 976 |
| 2.0 | 976 |
| 2.0 | 976 |
| 2.0 | 976 |
| 2.0 | 976 |
| 2.0 | 976 |
| 2.0 | 976 |
| 2.0 | 976 |
| 2.0 | 976 |
| 2.0 | 976 |
| 2.0 | 976 |
| 2.0 | 976 |
| 2.0 | 976 |
| 2.0 | 976 |
| 2.0 | 976 |
| 2.0 | 976 |
| 2.0 | 976 |
| 2.0 | 976 |
| 2.0 | 976 |
| 2.0 | 976 |
| 2.0 | 976 |
| 2.0 | 976 |
| 2.0 | 976 |
| 2.0 | 976 |
| 2.0 | 976 |
| 2.0 | 976 |
| 2.0 | 976 |
| 2.0 | 976 |
| 2.0 | 976 |
| 2.0 | 976 |
| 2.0 | 976 |
| 2.0 | 976 |
| 2.0 | 976 |
| 2.0 | 976 |
| 2.0 | 976 |
| 2.0 | 976 |
| 2.0 | 976 |
| 2.0 | 976 |
| 2.0 | 976 |
| 2.0 | 976 |
| 2.0 | 976 |
| 2.0 | 976 |
| 2.0 | 976 |
| 2.0 | 976 |
| 2.0 | 976 |
| 2.0 | 976 |
| 2.0 | 976 |
| 2.0 | 976 |
| 2.0 | 976 |
| 2.0 | 976 |
| 2.0 | 976 |
| 2.0 | 976 |
| 2.0 | 976 |
| 2.0 | 976 |
| 2.0 | 976 |
| 2.0 | 976 |
| 2.0 | 976 |
| 2.0 | 976 |
| 2.0 | 976 |
| 2.0 | 976 |
| 2.0 | 976 |
| 2.0 | 976 |
| 2.0 | 976 |
| 2.0 | 976 |
| 2.0 | 976 |
| 2.0 | 976 |
| 2.0 | 976 |
| 2.0 | 976 |
| 2.0 | 976 |
| 2.0 | 976 |
| 2.0 | 976 |
| 2.0 | 976 |
| 2.0 | 976 |
| 2.0 | 976 |
| 2.0 | 976 |
| 2.0 | 976 |
| 2.0 | 976 |
| 2.0 | 976 |
| 2.0 | 976 |
| 2.0 | 976 |
| 2.0 | 976 |
| 2.0 | 976 |
| 2.0 | 976 |
| 2.0 | 976 |
| 2.0 | 976 |
| 2.0 | 976 |
| 2.0 | 976 |
| 2.0 | 976 |
| 2.0 | 976 |
| 2.0 | 976 |
| 2.0 | 976 |
| 2.0 | 976 |
| 2.0 | 976 |
| 2.0 | 976 |
| 2.0 | 976 |
| 2.0 | 976 |
| 2.0 | 976 |
| 2.0 | 976 |
| 2.0 | 976 |
| 2.0 | 976 |
| 2.0 | 976 |
| 2.0 | 976 |
| 2.0 | 976 |
| 2.0 | 976 |
| 2.0 | 976 |
| 2.0 | 976 |
| 2.0 | 976 |
| 2.0 | 976 |
| 2.0 | 976 |
| 2.0 | 976 |
| 2.0 | 976 |
| 2.0 | 976 |
| 2.0 | 976 |
| 2.0 | 976 |
| 2.0 | 976 |
| 2.0 | 976 |
| 2.0 | 976 |
| 2.0 | 976 |
| 2.0 | 976 |
| 2.0 | 976 |
| 2.0 | 976 |
| 2.0 | 976 |
| 2.0 | 976 |
| 2.0 | 976 |
| 2.0 | 976 |
| 2.0 | 976 |
| 2.0 | 976 |
| 2.0 | 976 |
| 2.0 | 976 |
| 2.0 | 976 |
| 2.0 | 976 |
| 2.0 | 976 |
| 2.0 | 976 |
| 2.0 | 976 |
| 2.0 | 976 |
| 2.0 | 976 |
| 2.0 | 976 |
| 2.0 | 976 |
| 2.0 | 976 |
| 2.0 | 976 |
| 2.0 | 976 |
| 2.0 | 976 |
| 2.0 | 976 |
| 2.0 | 976 |
| 1.0 | 1074 |
| 1.0 | 1074 |
| 1.0 | 1074 |
| 1.0 | 1074 |
| 1.0 | 1074 |
| 1.0 | 1074 |
| 1.0 | 1074 |
| 1.0 | 1074 |
| 1.0 | 1074 |
| 1.0 | 1074 |
| 1.0 | 1074 |
| 1.0 | 1074 |
| 1.0 | 1074 |
| 1.0 | 1074 |
| 1.0 | 1074 |
| 1.0 | 1074 |
| 1.0 | 1074 |
| 1.0 | 1074 |
| 1.0 | 1074 |
| 1.0 | 1074 |
| 1.0 | 1074 |
| 1.0 | 1074 |
| 1.0 | 1074 |
| 1.0 | 1074 |
| 1.0 | 1074 |
| 1.0 | 1074 |
| 1.0 | 1074 |
| 1.0 | 1074 |
| 1.0 | 1074 |
| 1.0 | 1074 |
| 1.0 | 1074 |
| 1.0 | 1074 |
| 1.0 | 1074 |
| 1.0 | 1074 |
| 1.0 | 1074 |
| 1.0 | 1074 |
| 1.0 | 1074 |
| 1.0 | 1074 |
| 1.0 | 1074 |
| 1.0 | 1074 |
| 1.0 | 1074 |
| 1.0 | 1074 |
| 1.0 | 1074 |
| 1.0 | 1074 |
| 1.0 | 1074 |
| 1.0 | 1074 |
| 1.0 | 1074 |
| 1.0 | 1074 |
| 1.0 | 1074 |
| 1.0 | 1074 |
| 1.0 | 1074 |
| 1.0 | 1074 |
| 1.0 | 1074 |
| 1.0 | 1074 |
| 1.0 | 1074 |
| 1.0 | 1074 |
| 1.0 | 1074 |
| 1.0 | 1074 |
| 1.0 | 1074 |
| 1.0 | 1074 |
| 1.0 | 1074 |
| 1.0 | 1074 |
| 1.0 | 1074 |
| 1.0 | 1074 |
| 1.0 | 1074 |
| 1.0 | 1074 |
| 1.0 | 1074 |
| 1.0 | 1074 |
| 1.0 | 1074 |
| 1.0 | 1074 |
| 1.0 | 1074 |
| 1.0 | 1074 |
| 1.0 | 1074 |
| 1.0 | 1074 |
| 1.0 | 1074 |
| 1.0 | 1074 |
| 1.0 | 1074 |
| 1.0 | 1074 |
| 1.0 | 1074 |
| 1.0 | 1074 |
| 1.0 | 1074 |
| 1.0 | 1074 |
| 1.0 | 1074 |
| 1.0 | 1074 |
| 1.0 | 1074 |
| 1.0 | 1074 |
| 1.0 | 1074 |
| 1.0 | 1074 |
| 1.0 | 1074 |
| 1.0 | 1074 |
| 1.0 | 1074 |
| 1.0 | 1074 |
| 1.0 | 1074 |
| 1.0 | 1074 |
| 1.0 | 1074 |
| 1.0 | 1074 |
| 1.0 | 1074 |
| 1.0 | 1074 |
| 1.0 | 1074 |
| 1.0 | 1074 |
| 1.0 | 1074 |
| 1.0 | 1074 |
| 1.0 | 1074 |
| 1.0 | 1074 |
| 1.0 | 1074 |
| 1.0 | 1074 |
| 1.0 | 1074 |
| 1.0 | 1074 |
| 1.0 | 1074 |
| 1.0 | 1074 |
| 1.0 | 1074 |
| 1.0 | 1074 |
| 1.0 | 1074 |
| 1.0 | 1074 |
| 1.0 | 1074 |
| 1.0 | 1074 |
| 1.0 | 1074 |
| 1.0 | 1074 |
| 1.0 | 1074 |
| 1.0 | 1074 |
| 1.0 | 1074 |
| 1.0 | 1074 |
| 1.0 | 1074 |
| 1.0 | 1074 |
| 1.0 | 1074 |
| 1.0 | 1074 |
| 1.0 | 1074 |
| 1.0 | 1074 |
| 1.0 | 1074 |
| 1.0 | 1074 |
| 1.0 | 1074 |
| 1.0 | 1074 |
| 1.0 | 1074 |
| 1.0 | 1074 |
| 1.0 | 1074 |
| 1.0 | 1074 |
| 1.0 | 1074 |
| 1.0 | 1074 |
| 1.0 | 1074 |
| 1.0 | 1074 |
| 1.0 | 1074 |
| 1.0 | 1074 |
| 1.0 | 1074 |
| 1.0 | 1074 |
| 1.0 | 1074 |
| 1.0 | 1074 |
| 1.0 | 1074 |
| 1.0 | 1074 |
| 1.0 | 1074 |
| 1.0 | 1074 |
| 1.0 | 1074 |
| 1.0 | 1074 |
| 1.0 | 1074 |
| 1.0 | 1074 |
| 1.0 | 1074 |
| 1.0 | 1074 |
| 1.0 | 1074 |
| 1.0 | 1074 |
| 1.0 | 1074 |
| 1.0 | 1074 |
| 1.0 | 1074 |
| 1.0 | 1074 |
| 1.0 | 1074 |
| 1.0 | 1074 |
| 1.0 | 1074 |
| 1.0 | 1074 |
| 1.0 | 1074 |
| 1.0 | 1074 |
| 1.0 | 1074 |
| 1.0 | 1074 |
| 1.0 | 1074 |
| 1.0 | 1074 |
| 1.0 | 1074 |
| 1.0 | 1074 |
| 1.0 | 1074 |
| 1.0 | 1074 |
| 1.0 | 1074 |
| 1.0 | 1074 |
| 1.0 | 1074 |
| 1.0 | 1074 |
| 1.0 | 1074 |
| 1.0 | 1074 |
| 1.0 | 1074 |
| 1.0 | 1074 |
| 1.0 | 1074 |
| 1.0 | 1074 |
| 1.0 | 1074 |
| 1.0 | 1074 |
| 1.0 | 1074 |
| 1.0 | 1074 |
| 1.0 | 1074 |
| 1.0 | 1074 |
| 1.0 | 1074 |
| 1.0 | 1074 |
| 1.0 | 1074 |
| 1.0 | 1074 |
| 1.0 | 1074 |
| 1.0 | 1074 |
| 1.0 | 1074 |
| 1.0 | 1074 |
| 1.0 | 1074 |
| 1.0 | 1074 |
| 1.0 | 1074 |
| 1.0 | 1074 |
| 1.0 | 1074 |
| 1.0 | 1074 |
| 1.0 | 1074 |
| 1.0 | 1074 |
| 1.0 | 1074 |
| 1.0 | 1074 |
| 1.0 | 1074 |
| 1.0 | 1074 |
| 1.0 | 1074 |
| 1.0 | 1074 |
| 1.0 | 1074 |
| 1.0 | 1074 |
| 1.0 | 1074 |
| 1.0 | 1074 |
| 1.0 | 1074 |
| 1.0 | 1074 |
| 1.0 | 1074 |
| 1.0 | 1074 |
| 1.0 | 1074 |
| 1.0 | 1074 |
| 1.0 | 1074 |
| 1.0 | 1074 |
| 1.0 | 1074 |
| 1.0 | 1074 |
| 1.0 | 1074 |
| 1.0 | 1074 |
| 1.0 | 1074 |
| 1.0 | 1074 |
| 1.0 | 1074 |
| 1.0 | 1074 |
| 1.0 | 1074 |
| 1.0 | 1074 |
| 1.0 | 1074 |
| 1.0 | 1074 |
| 1.0 | 1074 |
| 1.0 | 1074 |
| 1.0 | 1074 |
| 1.0 | 1074 |
| 1.0 | 1074 |
| 1.0 | 1074 |
| 1.0 | 1074 |
| 1.0 | 1074 |
| 1.0 | 1074 |
| 1.0 | 1074 |
| 1.0 | 1074 |
| 1.0 | 1074 |
| 1.0 | 1074 |
| 1.0 | 1074 |
| 1.0 | 1074 |
| 1.0 | 1074 |
| 1.0 | 1074 |
| 1.0 | 1074 |
| 1.0 | 1074 |
| 1.0 | 1074 |
| 1.0 | 1074 |
| 1.0 | 1074 |
| 1.0 | 1074 |
| 1.0 | 1074 |
| 1.0 | 1074 |
| 1.0 | 1074 |
| 1.0 | 1074 |
| 1.0 | 1074 |
| 1.0 | 1074 |
| 1.0 | 1074 |
| 1.0 | 1074 |
| 1.0 | 1074 |
| 1.0 | 1074 |
| 1.0 | 1074 |
| 1.0 | 1074 |
| 1.0 | 1074 |
| 1.0 | 1074 |
| 1.0 | 1074 |
| 1.0 | 1074 |
| 1.0 | 1074 |
| 1.0 | 1074 |
| 1.0 | 1074 |
| 1.0 | 1074 |
| 1.0 | 1074 |
| 1.0 | 1074 |
| 1.0 | 1074 |
| 1.0 | 1074 |
| 1.0 | 1074 |
| 1.0 | 1074 |
| 1.0 | 1074 |
| 1.0 | 1074 |
| 1.0 | 1074 |
| 1.0 | 1074 |
| 1.0 | 1074 |
| 1.0 | 1074 |
| 1.0 | 1074 |
| 1.0 | 1074 |
| 1.0 | 1074 |
| 1.0 | 1074 |
| 1.0 | 1074 |
| 1.0 | 1074 |
| 1.0 | 1074 |
| 1.0 | 1074 |
| 1.0 | 1074 |
| 1.0 | 1074 |
| 1.0 | 1074 |
| 1.0 | 1074 |
| 1.0 | 1074 |
| 1.0 | 1074 |
| 1.0 | 1074 |
| 1.0 | 1074 |
| 1.0 | 1074 |
| 1.0 | 1074 |
| 1.0 | 1074 |
| 1.0 | 1074 |
| 1.0 | 1074 |
| 1.0 | 1074 |
| 1.0 | 1074 |
| 1.0 | 1074 |
| 1.0 | 1074 |
| 1.0 | 1074 |
| 1.0 | 1074 |
| 1.0 | 1074 |
| 1.0 | 1074 |
| 1.0 | 1074 |
| 1.0 | 1074 |
| 1.0 | 1074 |
| 1.0 | 1074 |
| 1.0 | 1074 |
| 1.0 | 1074 |
| 1.0 | 1074 |
| 1.0 | 1074 |
| 1.0 | 1074 |
| 1.0 | 1074 |
| 1.0 | 1074 |
| 1.0 | 1074 |
| 1.0 | 1074 |
| 1.0 | 1074 |
| 1.0 | 1074 |
| 1.0 | 1074 |
| 1.0 | 1074 |
| 1.0 | 1074 |
| 1.0 | 1074 |
| 1.0 | 1074 |
| 1.0 | 1074 |
| 1.0 | 1074 |
| 1.0 | 1074 |
| 1.0 | 1074 |
| 1.0 | 1074 |
| 1.0 | 1074 |
| 1.0 | 1074 |
| 1.0 | 1074 |
| 1.0 | 1074 |
| 1.0 | 1074 |
| 1.0 | 1074 |
| 1.0 | 1074 |
| 1.0 | 1074 |
| 1.0 | 1074 |
| 1.0 | 1074 |
| 1.0 | 1074 |
| 1.0 | 1074 |
| 1.0 | 1074 |
| 1.0 | 1074 |
| 1.0 | 1074 |
| 1.0 | 1074 |
| 1.0 | 1074 |
| 1.0 | 1074 |
| 1.0 | 1074 |
| 1.0 | 1074 |
| 1.0 | 1074 |
| 1.0 | 1074 |
| 1.0 | 1074 |
| 1.0 | 1074 |
| 1.0 | 1074 |
| 1.0 | 1074 |
| 1.0 | 1074 |
| 1.0 | 1074 |
| 1.0 | 1074 |
| 1.0 | 1074 |
| 1.0 | 1074 |
| 1.0 | 1074 |
| 1.0 | 1074 |
| 1.0 | 1074 |
| 1.0 | 1074 |
| 1.0 | 1074 |
| 1.0 | 1074 |
| 1.0 | 1074 |
| 1.0 | 1074 |
| 1.0 | 1074 |
| 1.0 | 1074 |
| 1.0 | 1074 |
| 1.0 | 1074 |
| 1.0 | 1074 |
| 1.0 | 1074 |
| 1.0 | 1074 |
| 1.0 | 1074 |
| 1.0 | 1074 |
| 1.0 | 1074 |
| 1.0 | 1074 |
| 1.0 | 1074 |
| 1.0 | 1074 |
| 1.0 | 1074 |
| 1.0 | 1074 |
| 1.0 | 1074 |
| 1.0 | 1074 |
| 1.0 | 1074 |
| 1.0 | 1074 |
| 1.0 | 1074 |
| 1.0 | 1074 |
| 1.0 | 1074 |
| 1.0 | 1074 |
| 1.0 | 1074 |
| 1.0 | 1074 |
| 1.0 | 1074 |
| 1.0 | 1074 |
| 1.0 | 1074 |
| 1.0 | 1074 |
| 1.0 | 1074 |
| 1.0 | 1074 |
| 1.0 | 1074 |
| 1.0 | 1074 |
| 1.0 | 1074 |
| 1.0 | 1074 |
| 1.0 | 1074 |
| 1.0 | 1074 |
| 1.0 | 1074 |
| 1.0 | 1074 |
| 1.0 | 1074 |
| 1.0 | 1074 |
| 1.0 | 1074 |
| 1.0 | 1074 |
| 1.0 | 1074 |
| 1.0 | 1074 |
| 1.0 | 1074 |
| 1.0 | 1074 |
| 1.0 | 1074 |
| 1.0 | 1074 |
| 1.0 | 1074 |
| 1.0 | 1074 |
| 1.0 | 1074 |
| 1.0 | 1074 |
| 1.0 | 1074 |
| 1.0 | 1074 |
| 1.0 | 1074 |
| 1.0 | 1074 |
| 1.0 | 1074 |
| 1.0 | 1074 |
| 1.0 | 1074 |
| 1.0 | 1074 |
| 1.0 | 1074 |
| 1.0 | 1074 |
| 1.0 | 1074 |
| 1.0 | 1074 |
| 1.0 | 1074 |
| 1.0 | 1074 |
| 1.0 | 1074 |
| 1.0 | 1074 |
| 1.0 | 1074 |
| 1.0 | 1074 |
| 1.0 | 1074 |
| 1.0 | 1074 |
| 1.0 | 1074 |
| 1.0 | 1074 |
| 1.0 | 1074 |
| 1.0 | 1074 |
| 1.0 | 1074 |
| 1.0 | 1074 |
| 1.0 | 1074 |
| 1.0 | 1074 |
| 1.0 | 1074 |
| 1.0 | 1074 |
| 1.0 | 1074 |
| 1.0 | 1074 |
| 1.0 | 1074 |
| 1.0 | 1074 |
| 1.0 | 1074 |
| 1.0 | 1074 |
| 1.0 | 1074 |
| 1.0 | 1074 |
| 1.0 | 1074 |
| 1.0 | 1074 |
| 1.0 | 1074 |
| 1.0 | 1074 |
| 1.0 | 1074 |
| 1.0 | 1074 |
| 1.0 | 1074 |
| 1.0 | 1074 |
| 1.0 | 1074 |
| 1.0 | 1074 |
| 1.0 | 1074 |
| 1.0 | 1074 |
| 1.0 | 1074 |
| 1.0 | 1074 |
| 1.0 | 1074 |
| 1.0 | 1074 |
| 1.0 | 1074 |
| 1.0 | 1074 |
| 1.0 | 1074 |
| 1.0 | 1074 |
| 1.0 | 1074 |
| 1.0 | 1074 |
| 1.0 | 1074 |
| 1.0 | 1074 |
| 1.0 | 1074 |
| 1.0 | 1074 |
| 1.0 | 1074 |
| 1.0 | 1074 |
| 1.0 | 1074 |
| 1.0 | 1074 |
| 1.0 | 1074 |
| 1.0 | 1074 |
| 1.0 | 1074 |
| 1.0 | 1074 |
| 1.0 | 1074 |
| 1.0 | 1074 |
| 1.0 | 1074 |
| 1.0 | 1074 |
| 1.0 | 1074 |
| 1.0 | 1074 |
| 1.0 | 1074 |
| 1.0 | 1074 |
| 1.0 | 1074 |
| 1.0 | 1074 |
| 1.0 | 1074 |
| 1.0 | 1074 |
| 1.0 | 1074 |
| 1.0 | 1074 |
| 1.0 | 1074 |
| 1.0 | 1074 |
| 1.0 | 1074 |
| 1.0 | 1074 |
| 1.0 | 1074 |
| 1.0 | 1074 |
| 1.0 | 1074 |
| 1.0 | 1074 |
| 1.0 | 1074 |
| 1.0 | 1074 |
| 1.0 | 1074 |
| 1.0 | 1074 |
| 1.0 | 1074 |
| 1.0 | 1074 |
| 1.0 | 1074 |
| 1.0 | 1074 |
| 1.0 | 1074 |
| 1.0 | 1074 |
| 1.0 | 1074 |
| 1.0 | 1074 |
| 1.0 | 1074 |
| 1.0 | 1074 |
| 1.0 | 1074 |
| 1.0 | 1074 |
| 1.0 | 1074 |
| 1.0 | 1074 |
| 1.0 | 1074 |
| 1.0 | 1074 |
| 1.0 | 1074 |
| 1.0 | 1074 |
| 1.0 | 1074 |
| 1.0 | 1074 |
| 1.0 | 1074 |
| 1.0 | 1074 |
| 1.0 | 1074 |
| 1.0 | 1074 |
| 1.0 | 1074 |
| 1.0 | 1074 |
| 1.0 | 1074 |
| 1.0 | 1074 |
| 1.0 | 1074 |
| 1.0 | 1074 |
| 1.0 | 1074 |
| 1.0 | 1074 |
| 1.0 | 1074 |
| 1.0 | 1074 |
| 1.0 | 1074 |
| 1.0 | 1074 |
| 1.0 | 1074 |
| 1.0 | 1074 |
| 1.0 | 1074 |
| 1.0 | 1074 |
| 1.0 | 1074 |
| 1.0 | 1074 |
| 1.0 | 1074 |
| 1.0 | 1074 |
| 1.0 | 1074 |
| 1.0 | 1074 |
| 1.0 | 1074 |
| 1.0 | 1074 |
| 1.0 | 1074 |
| 1.0 | 1074 |
| 1.0 | 1074 |
| 1.0 | 1074 |
| 1.0 | 1074 |
| 1.0 | 1074 |
| 1.0 | 1074 |
| 1.0 | 1074 |
| 1.0 | 1074 |
| 1.0 | 1074 |
| 1.0 | 1074 |
| 1.0 | 1074 |
| 1.0 | 1074 |
| 1.0 | 1074 |
| 1.0 | 1074 |
| 1.0 | 1074 |
| 1.0 | 1074 |
| 1.0 | 1074 |
| 1.0 | 1074 |
| 1.0 | 1074 |
| 1.0 | 1074 |
| 1.0 | 1074 |
| 1.0 | 1074 |
| 1.0 | 1074 |
| 1.0 | 1074 |
| 1.0 | 1074 |
| 1.0 | 1074 |
| 1.0 | 1074 |
| 1.0 | 1074 |
| 1.0 | 1074 |
| 1.0 | 1074 |
| 1.0 | 1074 |
| 1.0 | 1074 |
| 1.0 | 1074 |
| 1.0 | 1074 |
| 1.0 | 1074 |
| 1.0 | 1074 |
| 1.0 | 1074 |
| 1.0 | 1074 |
| 1.0 | 1074 |
| 1.0 | 1074 |
| 1.0 | 1074 |
| 1.0 | 1074 |
| 1.0 | 1074 |
| 1.0 | 1074 |
| 1.0 | 1074 |
| 1.0 | 1074 |
| 1.0 | 1074 |
| 1.0 | 1074 |
| 1.0 | 1074 |
| 1.0 | 1074 |
| 1.0 | 1074 |
| 1.0 | 1074 |
| 1.0 | 1074 |
| 1.0 | 1074 |
| 1.0 | 1074 |
| 1.0 | 1074 |
| 1.0 | 1074 |
| 1.0 | 1074 |
| 1.0 | 1074 |
| 1.0 | 1074 |
| 1.0 | 1074 |
| 1.0 | 1074 |
| 1.0 | 1074 |
| 1.0 | 1074 |
| 1.0 | 1074 |
| 1.0 | 1074 |
| 1.0 | 1074 |
| 1.0 | 1074 |
| 1.0 | 1074 |
| 1.0 | 1074 |
| 1.0 | 1074 |
| 1.0 | 1074 |
| 1.0 | 1074 |
| 1.0 | 1074 |
| 1.0 | 1074 |
| 1.0 | 1074 |
| 1.0 | 1074 |
| 1.0 | 1074 |
| 1.0 | 1074 |
| 1.0 | 1074 |
| 1.0 | 1074 |
| 1.0 | 1074 |
| 1.0 | 1074 |
| 1.0 | 1074 |
| 1.0 | 1074 |
| 1.0 | 1074 |
| 1.0 | 1074 |
| 1.0 | 1074 |
| 1.0 | 1074 |
| 1.0 | 1074 |
| 1.0 | 1074 |
| 1.0 | 1074 |
| 1.0 | 1074 |
| 1.0 | 1074 |
| 1.0 | 1074 |
| 1.0 | 1074 |
| 1.0 | 1074 |
| 1.0 | 1074 |
| 1.0 | 1074 |
| 1.0 | 1074 |
| 1.0 | 1074 |
| 1.0 | 1074 |
| 1.0 | 1074 |
| 1.0 | 1074 |
| 1.0 | 1074 |
| 1.0 | 1074 |
| 1.0 | 1074 |
| 1.0 | 1074 |
| 1.0 | 1074 |
| 1.0 | 1074 |
| 1.0 | 1074 |
| 1.0 | 1074 |
| 1.0 | 1074 |
| 1.0 | 1074 |
| 1.0 | 1074 |
| 1.0 | 1074 |
| 1.0 | 1074 |
| 1.0 | 1074 |
| 1.0 | 1074 |
| 1.0 | 1074 |
| 1.0 | 1074 |
| 1.0 | 1074 |
| 1.0 | 1074 |
| 1.0 | 1074 |
| 1.0 | 1074 |
| 1.0 | 1074 |
| 1.0 | 1074 |
| 1.0 | 1074 |
| 1.0 | 1074 |
| 1.0 | 1074 |
| 1.0 | 1074 |
| 1.0 | 1074 |
| 1.0 | 1074 |
| 1.0 | 1074 |
| 1.0 | 1074 |
| 1.0 | 1074 |
| 1.0 | 1074 |
| 1.0 | 1074 |
| 1.0 | 1074 |
| 1.0 | 1074 |
| 1.0 | 1074 |
| 1.0 | 1074 |
| 1.0 | 1074 |
| 1.0 | 1074 |
| 1.0 | 1074 |
| 1.0 | 1074 |
| 1.0 | 1074 |
| 1.0 | 1074 |
| 1.0 | 1074 |
| 1.0 | 1074 |
| 1.0 | 1074 |
| 1.0 | 1074 |
| 1.0 | 1074 |
| 1.0 | 1074 |
| 1.0 | 1074 |
| 1.0 | 1074 |
| 1.0 | 1074 |
| 1.0 | 1074 |
| 1.0 | 1074 |
| 1.0 | 1074 |
| 1.0 | 1074 |
| 1.0 | 1074 |
| 1.0 | 1074 |
| 1.0 | 1074 |
| 1.0 | 1074 |
| 1.0 | 1074 |
| 1.0 | 1074 |
| 1.0 | 1074 |
| 1.0 | 1074 |
| 1.0 | 1074 |
| 1.0 | 1074 |
| 1.0 | 1074 |
| 1.0 | 1074 |
| 1.0 | 1074 |
| 1.0 | 1074 |
| 1.0 | 1074 |
| 1.0 | 1074 |
| 1.0 | 1074 |
| 1.0 | 1074 |
| 1.0 | 1074 |
| 1.0 | 1074 |
| 1.0 | 1074 |
| 1.0 | 1074 |
| 1.0 | 1074 |
| 1.0 | 1074 |
| 1.0 | 1074 |
| 1.0 | 1074 |
| 1.0 | 1074 |
| 1.0 | 1074 |
| 1.0 | 1074 |
| 1.0 | 1074 |
| 1.0 | 1074 |
| 1.0 | 1074 |
| 1.0 | 1074 |
| 1.0 | 1074 |
| 1.0 | 1074 |
| 1.0 | 1074 |
| 1.0 | 1074 |
| 1.0 | 1074 |
| 1.0 | 1074 |
| 1.0 | 1074 |
| 1.0 | 1074 |
| 1.0 | 1074 |
| 1.0 | 1074 |
| 1.0 | 1074 |
| 1.0 | 1074 |
| 1.0 | 1074 |
| 1.0 | 1074 |
| 1.0 | 1074 |
| 1.0 | 1074 |
| 1.0 | 1074 |
| 1.0 | 1074 |
| 1.0 | 1074 |
| 1.0 | 1074 |
| 1.0 | 1074 |
| 1.0 | 1074 |
| 1.0 | 1074 |
| 1.0 | 1074 |
| 1.0 | 1074 |
| 1.0 | 1074 |
| 1.0 | 1074 |
| 1.0 | 1074 |
| 1.0 | 1074 |
| 1.0 | 1074 |
| 1.0 | 1074 |
| 1.0 | 1074 |
| 1.0 | 1074 |
| 1.0 | 1074 |
| 1.0 | 1074 |
| 1.0 | 1074 |
| 1.0 | 1074 |
| 1.0 | 1074 |
| 1.0 | 1074 |
| 1.0 | 1074 |
| 1.0 | 1074 |
| 1.0 | 1074 |
| 1.0 | 1074 |
| 1.0 | 1074 |
| 1.0 | 1074 |
| 1.0 | 1074 |
| 1.0 | 1074 |
| 1.0 | 1074 |
| 1.0 | 1074 |
| 1.0 | 1074 |
| 1.0 | 1074 |
| 1.0 | 1074 |
| 1.0 | 1074 |
| 1.0 | 1074 |
| 1.0 | 1074 |
| 1.0 | 1074 |
| 1.0 | 1074 |
| 1.0 | 1074 |
| 1.0 | 1074 |
| 1.0 | 1074 |
| 1.0 | 1074 |
| 1.0 | 1074 |
| 1.0 | 1074 |
| 1.0 | 1074 |
| 1.0 | 1074 |
| 1.0 | 1074 |
| 1.0 | 1074 |
| 1.0 | 1074 |
| 1.0 | 1074 |
| 1.0 | 1074 |
| 1.0 | 1074 |
| 1.0 | 1074 |
| 1.0 | 1074 |
| 1.0 | 1074 |
| 1.0 | 1074 |
| 1.0 | 1074 |
| 1.0 | 1074 |
| 1.0 | 1074 |
| 1.0 | 1074 |
| 1.0 | 1074 |
| 1.0 | 1074 |
| 1.0 | 1074 |
| 1.0 | 1074 |
| 1.0 | 1074 |
| 1.0 | 1074 |
| 1.0 | 1074 |
| 1.0 | 1074 |
| 1.0 | 1074 |
| 1.0 | 1074 |
| 1.0 | 1074 |
| 1.0 | 1074 |
| 1.0 | 1074 |
| 1.0 | 1074 |
| 1.0 | 1074 |
| 1.0 | 1074 |
| 1.0 | 1074 |
| 1.0 | 1074 |
| 1.0 | 1074 |
| 1.0 | 1074 |
| 1.0 | 1074 |
| 1.0 | 1074 |
| 1.0 | 1074 |
| 1.0 | 1074 |
| 1.0 | 1074 |
| 1.0 | 1074 |
| 1.0 | 1074 |
| 1.0 | 1074 |
| 1.0 | 1074 |
| 1.0 | 1074 |
| 1.0 | 1074 |
| 1.0 | 1074 |
| 1.0 | 1074 |
| 1.0 | 1074 |
| 1.0 | 1074 |
| 1.0 | 1074 |
| 1.0 | 1074 |
| 1.0 | 1074 |
| 1.0 | 1074 |
| 1.0 | 1074 |
| 1.0 | 1074 |
| 1.0 | 1074 |
| 1.0 | 1074 |
| 1.0 | 1074 |
| 1.0 | 1074 |
| 1.0 | 1074 |
| 1.0 | 1074 |
| 1.0 | 1074 |
| 1.0 | 1074 |
| 1.0 | 1074 |
| 1.0 | 1074 |
| 1.0 | 1074 |
| 1.0 | 1074 |
| 1.0 | 1074 |
| 1.0 | 1074 |
| 1.0 | 1074 |
| 1.0 | 1074 |
| 1.0 | 1074 |
| 1.0 | 1074 |
| 1.0 | 1074 |
| 1.0 | 1074 |
| 1.0 | 1074 |
| 1.0 | 1074 |
| 1.0 | 1074 |
| 1.0 | 1074 |
| 1.0 | 1074 |
| 1.0 | 1074 |
| 1.0 | 1074 |
| 1.0 | 1074 |
| 1.0 | 1074 |
| 1.0 | 1074 |
| 1.0 | 1074 |
| 1.0 | 1074 |
| 1.0 | 1074 |
| 1.0 | 1074 |
| 1.0 | 1074 |
| 1.0 | 1074 |
| 1.0 | 1074 |
| 1.0 | 1074 |
| 1.0 | 1074 |
| 1.0 | 1074 |
| 1.0 | 1074 |
| 1.0 | 1074 |
| 1.0 | 1074 |
| 1.0 | 1074 |
| 1.0 | 1074 |
| 1.0 | 1074 |
| 1.0 | 1074 |
| 1.0 | 1074 |
| 1.0 | 1074 |
| 1.0 | 1074 |
| 1.0 | 1074 |
| 1.0 | 1074 |
| 1.0 | 1074 |
| 1.0 | 1074 |
| 1.0 | 1074 |
| 1.0 | 1074 |
| 1.0 | 1074 |
| 1.0 | 1074 |
| 1.0 | 1074 |
| 1.0 | 1074 |
| 1.0 | 1074 |
| 1.0 | 1074 |
| 1.0 | 1074 |
| 1.0 | 1074 |
| 1.0 | 1074 |
| 1.0 | 1074 |
| 1.0 | 1074 |
| 1.0 | 1074 |
| 1.0 | 1074 |
| 1.0 | 1074 |
| 1.0 | 1074 |
| 1.0 | 1074 |
| 1.0 | 1074 |
| 1.0 | 1074 |
| 1.0 | 1074 |
| 1.0 | 1074 |
| 1.0 | 1074 |
| 1.0 | 1074 |
| 1.0 | 1074 |
| 1.0 | 1074 |
| 1.0 | 1074 |
| 1.0 | 1074 |
| 1.0 | 1074 |
| 1.0 | 1074 |
| 1.0 | 1074 |
| 1.0 | 1074 |
| 1.0 | 1074 |
| 1.0 | 1074 |
| 1.0 | 1074 |
| 1.0 | 1074 |
| 1.0 | 1074 |
| 1.0 | 1074 |
| 1.0 | 1074 |
| 1.0 | 1074 |
| 1.0 | 1074 |
| 1.0 | 1074 |
| 1.0 | 1074 |
| 1.0 | 1074 |
| 1.0 | 1074 |
| 1.0 | 1074 |
| 1.0 | 1074 |
| 1.0 | 1074 |
| 1.0 | 1074 |
| 1.0 | 1074 |
| 1.0 | 1074 |
| 1.0 | 1074 |
| 1.0 | 1074 |
| 1.0 | 1074 |
| 1.0 | 1074 |
| 1.0 | 1074 |
| 1.0 | 1074 |
| 1.0 | 1074 |
| 1.0 | 1074 |
| 1.0 | 1074 |
| 1.0 | 1074 |
| 1.0 | 1074 |
| 1.0 | 1074 |
| 1.0 | 1074 |
| 1.0 | 1074 |
| 1.0 | 1074 |
| 1.0 | 1074 |
| 1.0 | 1074 |
| 1.0 | 1074 |
| 1.0 | 1074 |
| 1.0 | 1074 |
| 1.0 | 1074 |
| 1.0 | 1074 |
| 1.0 | 1074 |
| 1.0 | 1074 |
| 1.0 | 1074 |
| 1.0 | 1074 |
| 1.0 | 1074 |
| 1.0 | 1074 |
| 1.0 | 1074 |
| 1.0 | 1074 |
| 1.0 | 1074 |
| 1.0 | 1074 |
| 1.0 | 1074 |
| 1.0 | 1074 |
| 1.0 | 1074 |
| 1.0 | 1074 |
| 1.0 | 1074 |
| 1.0 | 1074 |
| 1.0 | 1074 |
| 1.0 | 1074 |
| 1.0 | 1074 |
| 1.0 | 1074 |
| 1.0 | 1074 |
| 1.0 | 1074 |
| 1.0 | 1074 |
| 1.0 | 1074 |
| 1.0 | 1074 |
| 1.0 | 1074 |
| 1.0 | 1074 |
| 1.0 | 1074 |
| 1.0 | 1074 |
| 1.0 | 1074 |
| 1.0 | 1074 |
| 1.0 | 1074 |
| 1.0 | 1074 |
| 1.0 | 1074 |
| 1.0 | 1074 |
| 1.0 | 1074 |
| 1.0 | 1074 |
| 1.0 | 1074 |
| 1.0 | 1074 |
| 1.0 | 1074 |
| 1.0 | 1074 |
| 1.0 | 1074 |
| 1.0 | 1074 |
| 1.0 | 1074 |
| 1.0 | 1074 |
| 1.0 | 1074 |
| 1.0 | 1074 |